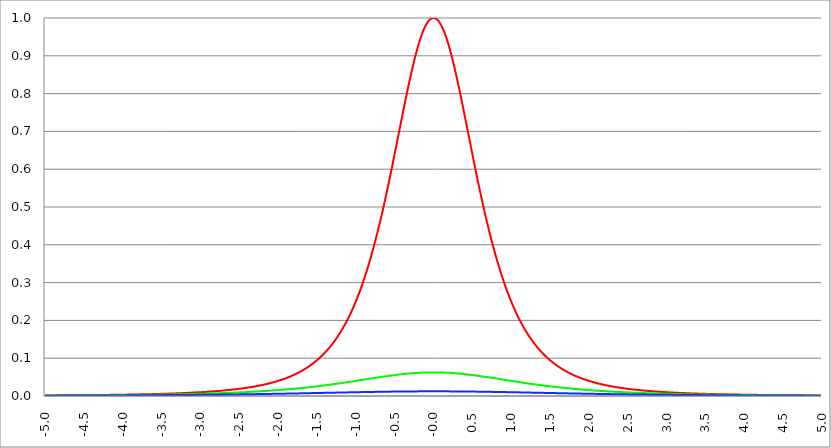
| Category | Series 1 | Series 0 | Series 2 |
|---|---|---|---|
| -5.0 | 0.001 | 0.001 | 0.001 |
| -4.995 | 0.001 | 0.001 | 0.001 |
| -4.99 | 0.001 | 0.001 | 0.001 |
| -4.985 | 0.001 | 0.001 | 0.001 |
| -4.98 | 0.002 | 0.001 | 0.001 |
| -4.975 | 0.002 | 0.001 | 0.001 |
| -4.97 | 0.002 | 0.001 | 0.001 |
| -4.965000000000001 | 0.002 | 0.001 | 0.001 |
| -4.960000000000001 | 0.002 | 0.001 | 0.001 |
| -4.955000000000001 | 0.002 | 0.001 | 0.001 |
| -4.950000000000001 | 0.002 | 0.001 | 0.001 |
| -4.945000000000001 | 0.002 | 0.001 | 0.001 |
| -4.940000000000001 | 0.002 | 0.001 | 0.001 |
| -4.935000000000001 | 0.002 | 0.001 | 0.001 |
| -4.930000000000001 | 0.002 | 0.001 | 0.001 |
| -4.925000000000002 | 0.002 | 0.001 | 0.001 |
| -4.920000000000002 | 0.002 | 0.001 | 0.001 |
| -4.915000000000002 | 0.002 | 0.001 | 0.001 |
| -4.910000000000002 | 0.002 | 0.001 | 0.001 |
| -4.905000000000002 | 0.002 | 0.001 | 0.001 |
| -4.900000000000002 | 0.002 | 0.001 | 0.001 |
| -4.895000000000002 | 0.002 | 0.001 | 0.001 |
| -4.890000000000002 | 0.002 | 0.001 | 0.001 |
| -4.885000000000002 | 0.002 | 0.001 | 0.001 |
| -4.880000000000002 | 0.002 | 0.001 | 0.001 |
| -4.875000000000003 | 0.002 | 0.001 | 0.001 |
| -4.870000000000003 | 0.002 | 0.001 | 0.001 |
| -4.865000000000003 | 0.002 | 0.001 | 0.001 |
| -4.860000000000003 | 0.002 | 0.001 | 0.001 |
| -4.855000000000003 | 0.002 | 0.001 | 0.001 |
| -4.850000000000003 | 0.002 | 0.001 | 0.001 |
| -4.845000000000003 | 0.002 | 0.001 | 0.001 |
| -4.840000000000003 | 0.002 | 0.001 | 0.001 |
| -4.835000000000003 | 0.002 | 0.001 | 0.001 |
| -4.830000000000004 | 0.002 | 0.001 | 0.001 |
| -4.825000000000004 | 0.002 | 0.001 | 0.001 |
| -4.820000000000004 | 0.002 | 0.001 | 0.001 |
| -4.815000000000004 | 0.002 | 0.001 | 0.001 |
| -4.810000000000004 | 0.002 | 0.001 | 0.001 |
| -4.805000000000004 | 0.002 | 0.001 | 0.001 |
| -4.800000000000004 | 0.002 | 0.001 | 0.001 |
| -4.795000000000004 | 0.002 | 0.001 | 0.001 |
| -4.790000000000004 | 0.002 | 0.001 | 0.001 |
| -4.785000000000004 | 0.002 | 0.001 | 0.001 |
| -4.780000000000004 | 0.002 | 0.001 | 0.001 |
| -4.775000000000004 | 0.002 | 0.001 | 0.001 |
| -4.770000000000004 | 0.002 | 0.001 | 0.001 |
| -4.765000000000005 | 0.002 | 0.001 | 0.001 |
| -4.760000000000005 | 0.002 | 0.001 | 0.001 |
| -4.755000000000005 | 0.002 | 0.001 | 0.001 |
| -4.750000000000005 | 0.002 | 0.001 | 0.001 |
| -4.745000000000005 | 0.002 | 0.001 | 0.001 |
| -4.740000000000005 | 0.002 | 0.001 | 0.001 |
| -4.735000000000005 | 0.002 | 0.001 | 0.001 |
| -4.730000000000005 | 0.002 | 0.001 | 0.001 |
| -4.725000000000006 | 0.002 | 0.001 | 0.001 |
| -4.720000000000006 | 0.002 | 0.001 | 0.001 |
| -4.715000000000006 | 0.002 | 0.001 | 0.001 |
| -4.710000000000006 | 0.002 | 0.001 | 0.001 |
| -4.705000000000006 | 0.002 | 0.001 | 0.001 |
| -4.700000000000006 | 0.002 | 0.001 | 0.001 |
| -4.695000000000006 | 0.002 | 0.001 | 0.001 |
| -4.690000000000006 | 0.002 | 0.001 | 0.001 |
| -4.685000000000007 | 0.002 | 0.001 | 0.001 |
| -4.680000000000007 | 0.002 | 0.001 | 0.001 |
| -4.675000000000007 | 0.002 | 0.001 | 0.001 |
| -4.670000000000007 | 0.002 | 0.002 | 0.001 |
| -4.665000000000007 | 0.002 | 0.002 | 0.001 |
| -4.660000000000007 | 0.002 | 0.002 | 0.001 |
| -4.655000000000007 | 0.002 | 0.002 | 0.001 |
| -4.650000000000007 | 0.002 | 0.002 | 0.001 |
| -4.645000000000007 | 0.002 | 0.002 | 0.001 |
| -4.640000000000008 | 0.002 | 0.002 | 0.001 |
| -4.635000000000008 | 0.002 | 0.002 | 0.001 |
| -4.630000000000008 | 0.002 | 0.002 | 0.001 |
| -4.625000000000008 | 0.002 | 0.002 | 0.001 |
| -4.620000000000008 | 0.002 | 0.002 | 0.001 |
| -4.615000000000008 | 0.002 | 0.002 | 0.001 |
| -4.610000000000008 | 0.002 | 0.002 | 0.001 |
| -4.605000000000008 | 0.002 | 0.002 | 0.001 |
| -4.600000000000008 | 0.002 | 0.002 | 0.001 |
| -4.595000000000009 | 0.002 | 0.002 | 0.001 |
| -4.590000000000009 | 0.002 | 0.002 | 0.001 |
| -4.585000000000009 | 0.002 | 0.002 | 0.001 |
| -4.580000000000009 | 0.002 | 0.002 | 0.001 |
| -4.57500000000001 | 0.002 | 0.002 | 0.001 |
| -4.57000000000001 | 0.002 | 0.002 | 0.001 |
| -4.565000000000009 | 0.002 | 0.002 | 0.001 |
| -4.560000000000009 | 0.002 | 0.002 | 0.001 |
| -4.555000000000009 | 0.002 | 0.002 | 0.001 |
| -4.55000000000001 | 0.002 | 0.002 | 0.001 |
| -4.54500000000001 | 0.002 | 0.002 | 0.001 |
| -4.54000000000001 | 0.002 | 0.002 | 0.001 |
| -4.53500000000001 | 0.002 | 0.002 | 0.001 |
| -4.53000000000001 | 0.002 | 0.002 | 0.001 |
| -4.52500000000001 | 0.002 | 0.002 | 0.001 |
| -4.52000000000001 | 0.002 | 0.002 | 0.001 |
| -4.51500000000001 | 0.002 | 0.002 | 0.001 |
| -4.51000000000001 | 0.002 | 0.002 | 0.001 |
| -4.505000000000011 | 0.002 | 0.002 | 0.001 |
| -4.500000000000011 | 0.002 | 0.002 | 0.001 |
| -4.495000000000011 | 0.002 | 0.002 | 0.001 |
| -4.490000000000011 | 0.002 | 0.002 | 0.001 |
| -4.485000000000011 | 0.002 | 0.002 | 0.001 |
| -4.480000000000011 | 0.002 | 0.002 | 0.001 |
| -4.475000000000011 | 0.002 | 0.002 | 0.001 |
| -4.470000000000011 | 0.002 | 0.002 | 0.001 |
| -4.465000000000011 | 0.002 | 0.002 | 0.001 |
| -4.460000000000011 | 0.002 | 0.002 | 0.001 |
| -4.455000000000012 | 0.002 | 0.002 | 0.001 |
| -4.450000000000012 | 0.002 | 0.002 | 0.001 |
| -4.445000000000012 | 0.002 | 0.002 | 0.001 |
| -4.440000000000012 | 0.002 | 0.002 | 0.001 |
| -4.435000000000012 | 0.002 | 0.002 | 0.001 |
| -4.430000000000012 | 0.002 | 0.002 | 0.001 |
| -4.425000000000012 | 0.002 | 0.002 | 0.001 |
| -4.420000000000012 | 0.002 | 0.002 | 0.001 |
| -4.415000000000012 | 0.002 | 0.002 | 0.001 |
| -4.410000000000013 | 0.002 | 0.002 | 0.001 |
| -4.405000000000013 | 0.002 | 0.002 | 0.001 |
| -4.400000000000013 | 0.002 | 0.002 | 0.001 |
| -4.395000000000013 | 0.002 | 0.002 | 0.001 |
| -4.390000000000013 | 0.002 | 0.002 | 0.001 |
| -4.385000000000013 | 0.002 | 0.002 | 0.001 |
| -4.380000000000013 | 0.002 | 0.002 | 0.001 |
| -4.375000000000013 | 0.002 | 0.002 | 0.001 |
| -4.370000000000013 | 0.002 | 0.002 | 0.001 |
| -4.365000000000013 | 0.002 | 0.002 | 0.001 |
| -4.360000000000014 | 0.002 | 0.002 | 0.001 |
| -4.355000000000014 | 0.003 | 0.002 | 0.001 |
| -4.350000000000014 | 0.003 | 0.002 | 0.001 |
| -4.345000000000014 | 0.003 | 0.002 | 0.001 |
| -4.340000000000014 | 0.003 | 0.002 | 0.001 |
| -4.335000000000014 | 0.003 | 0.002 | 0.001 |
| -4.330000000000014 | 0.003 | 0.002 | 0.001 |
| -4.325000000000014 | 0.003 | 0.002 | 0.001 |
| -4.320000000000014 | 0.003 | 0.002 | 0.001 |
| -4.315000000000015 | 0.003 | 0.002 | 0.001 |
| -4.310000000000015 | 0.003 | 0.002 | 0.001 |
| -4.305000000000015 | 0.003 | 0.002 | 0.001 |
| -4.300000000000015 | 0.003 | 0.002 | 0.001 |
| -4.295000000000015 | 0.003 | 0.002 | 0.001 |
| -4.290000000000015 | 0.003 | 0.002 | 0.001 |
| -4.285000000000015 | 0.003 | 0.002 | 0.001 |
| -4.280000000000015 | 0.003 | 0.002 | 0.001 |
| -4.275000000000015 | 0.003 | 0.002 | 0.001 |
| -4.270000000000015 | 0.003 | 0.002 | 0.001 |
| -4.265000000000016 | 0.003 | 0.002 | 0.001 |
| -4.260000000000016 | 0.003 | 0.002 | 0.001 |
| -4.255000000000016 | 0.003 | 0.002 | 0.001 |
| -4.250000000000016 | 0.003 | 0.002 | 0.001 |
| -4.245000000000016 | 0.003 | 0.002 | 0.001 |
| -4.240000000000016 | 0.003 | 0.002 | 0.001 |
| -4.235000000000016 | 0.003 | 0.002 | 0.001 |
| -4.230000000000016 | 0.003 | 0.002 | 0.001 |
| -4.225000000000017 | 0.003 | 0.002 | 0.001 |
| -4.220000000000017 | 0.003 | 0.002 | 0.001 |
| -4.215000000000017 | 0.003 | 0.002 | 0.001 |
| -4.210000000000017 | 0.003 | 0.002 | 0.001 |
| -4.205000000000017 | 0.003 | 0.002 | 0.001 |
| -4.200000000000017 | 0.003 | 0.002 | 0.001 |
| -4.195000000000017 | 0.003 | 0.002 | 0.001 |
| -4.190000000000017 | 0.003 | 0.002 | 0.001 |
| -4.185000000000017 | 0.003 | 0.002 | 0.001 |
| -4.180000000000017 | 0.003 | 0.002 | 0.001 |
| -4.175000000000018 | 0.003 | 0.002 | 0.001 |
| -4.170000000000018 | 0.003 | 0.002 | 0.001 |
| -4.165000000000018 | 0.003 | 0.002 | 0.001 |
| -4.160000000000018 | 0.003 | 0.002 | 0.001 |
| -4.155000000000018 | 0.003 | 0.002 | 0.001 |
| -4.150000000000018 | 0.003 | 0.002 | 0.001 |
| -4.145000000000018 | 0.003 | 0.002 | 0.001 |
| -4.140000000000018 | 0.003 | 0.002 | 0.001 |
| -4.135000000000018 | 0.003 | 0.002 | 0.001 |
| -4.130000000000019 | 0.003 | 0.002 | 0.001 |
| -4.125000000000019 | 0.003 | 0.002 | 0.001 |
| -4.120000000000019 | 0.003 | 0.002 | 0.001 |
| -4.115000000000019 | 0.003 | 0.002 | 0.001 |
| -4.110000000000019 | 0.003 | 0.002 | 0.001 |
| -4.105000000000019 | 0.003 | 0.002 | 0.001 |
| -4.100000000000019 | 0.003 | 0.002 | 0.002 |
| -4.095000000000019 | 0.003 | 0.002 | 0.002 |
| -4.090000000000019 | 0.003 | 0.002 | 0.002 |
| -4.085000000000019 | 0.003 | 0.002 | 0.002 |
| -4.08000000000002 | 0.003 | 0.002 | 0.002 |
| -4.07500000000002 | 0.003 | 0.002 | 0.002 |
| -4.07000000000002 | 0.003 | 0.002 | 0.002 |
| -4.06500000000002 | 0.003 | 0.002 | 0.002 |
| -4.06000000000002 | 0.003 | 0.002 | 0.002 |
| -4.05500000000002 | 0.003 | 0.002 | 0.002 |
| -4.05000000000002 | 0.003 | 0.002 | 0.002 |
| -4.04500000000002 | 0.003 | 0.002 | 0.002 |
| -4.04000000000002 | 0.003 | 0.002 | 0.002 |
| -4.03500000000002 | 0.003 | 0.002 | 0.002 |
| -4.03000000000002 | 0.003 | 0.002 | 0.002 |
| -4.025000000000021 | 0.003 | 0.002 | 0.002 |
| -4.020000000000021 | 0.003 | 0.002 | 0.002 |
| -4.015000000000021 | 0.003 | 0.002 | 0.002 |
| -4.010000000000021 | 0.003 | 0.002 | 0.002 |
| -4.005000000000021 | 0.003 | 0.002 | 0.002 |
| -4.000000000000021 | 0.003 | 0.002 | 0.002 |
| -3.995000000000021 | 0.003 | 0.003 | 0.002 |
| -3.990000000000021 | 0.003 | 0.003 | 0.002 |
| -3.985000000000022 | 0.004 | 0.003 | 0.002 |
| -3.980000000000022 | 0.004 | 0.003 | 0.002 |
| -3.975000000000022 | 0.004 | 0.003 | 0.002 |
| -3.970000000000022 | 0.004 | 0.003 | 0.002 |
| -3.965000000000022 | 0.004 | 0.003 | 0.002 |
| -3.960000000000022 | 0.004 | 0.003 | 0.002 |
| -3.955000000000022 | 0.004 | 0.003 | 0.002 |
| -3.950000000000022 | 0.004 | 0.003 | 0.002 |
| -3.945000000000022 | 0.004 | 0.003 | 0.002 |
| -3.940000000000023 | 0.004 | 0.003 | 0.002 |
| -3.935000000000023 | 0.004 | 0.003 | 0.002 |
| -3.930000000000023 | 0.004 | 0.003 | 0.002 |
| -3.925000000000023 | 0.004 | 0.003 | 0.002 |
| -3.920000000000023 | 0.004 | 0.003 | 0.002 |
| -3.915000000000023 | 0.004 | 0.003 | 0.002 |
| -3.910000000000023 | 0.004 | 0.003 | 0.002 |
| -3.905000000000023 | 0.004 | 0.003 | 0.002 |
| -3.900000000000023 | 0.004 | 0.003 | 0.002 |
| -3.895000000000023 | 0.004 | 0.003 | 0.002 |
| -3.890000000000024 | 0.004 | 0.003 | 0.002 |
| -3.885000000000024 | 0.004 | 0.003 | 0.002 |
| -3.880000000000024 | 0.004 | 0.003 | 0.002 |
| -3.875000000000024 | 0.004 | 0.003 | 0.002 |
| -3.870000000000024 | 0.004 | 0.003 | 0.002 |
| -3.865000000000024 | 0.004 | 0.003 | 0.002 |
| -3.860000000000024 | 0.004 | 0.003 | 0.002 |
| -3.855000000000024 | 0.004 | 0.003 | 0.002 |
| -3.850000000000024 | 0.004 | 0.003 | 0.002 |
| -3.845000000000025 | 0.004 | 0.003 | 0.002 |
| -3.840000000000025 | 0.004 | 0.003 | 0.002 |
| -3.835000000000025 | 0.004 | 0.003 | 0.002 |
| -3.830000000000025 | 0.004 | 0.003 | 0.002 |
| -3.825000000000025 | 0.004 | 0.003 | 0.002 |
| -3.820000000000025 | 0.004 | 0.003 | 0.002 |
| -3.815000000000025 | 0.004 | 0.003 | 0.002 |
| -3.810000000000025 | 0.004 | 0.003 | 0.002 |
| -3.805000000000025 | 0.004 | 0.003 | 0.002 |
| -3.800000000000026 | 0.004 | 0.003 | 0.002 |
| -3.795000000000026 | 0.004 | 0.003 | 0.002 |
| -3.790000000000026 | 0.004 | 0.003 | 0.002 |
| -3.785000000000026 | 0.004 | 0.003 | 0.002 |
| -3.780000000000026 | 0.004 | 0.003 | 0.002 |
| -3.775000000000026 | 0.004 | 0.003 | 0.002 |
| -3.770000000000026 | 0.004 | 0.003 | 0.002 |
| -3.765000000000026 | 0.004 | 0.003 | 0.002 |
| -3.760000000000026 | 0.004 | 0.003 | 0.002 |
| -3.755000000000026 | 0.004 | 0.003 | 0.002 |
| -3.750000000000027 | 0.004 | 0.003 | 0.002 |
| -3.745000000000027 | 0.004 | 0.003 | 0.002 |
| -3.740000000000027 | 0.004 | 0.003 | 0.002 |
| -3.735000000000027 | 0.004 | 0.003 | 0.002 |
| -3.730000000000027 | 0.004 | 0.003 | 0.002 |
| -3.725000000000027 | 0.005 | 0.003 | 0.002 |
| -3.720000000000027 | 0.005 | 0.003 | 0.002 |
| -3.715000000000027 | 0.005 | 0.003 | 0.002 |
| -3.710000000000027 | 0.005 | 0.003 | 0.002 |
| -3.705000000000028 | 0.005 | 0.003 | 0.002 |
| -3.700000000000028 | 0.005 | 0.003 | 0.002 |
| -3.695000000000028 | 0.005 | 0.003 | 0.002 |
| -3.690000000000028 | 0.005 | 0.003 | 0.002 |
| -3.685000000000028 | 0.005 | 0.003 | 0.002 |
| -3.680000000000028 | 0.005 | 0.003 | 0.002 |
| -3.675000000000028 | 0.005 | 0.003 | 0.002 |
| -3.670000000000028 | 0.005 | 0.003 | 0.002 |
| -3.665000000000028 | 0.005 | 0.003 | 0.002 |
| -3.660000000000028 | 0.005 | 0.003 | 0.002 |
| -3.655000000000029 | 0.005 | 0.003 | 0.002 |
| -3.650000000000029 | 0.005 | 0.003 | 0.002 |
| -3.645000000000029 | 0.005 | 0.003 | 0.002 |
| -3.640000000000029 | 0.005 | 0.003 | 0.002 |
| -3.635000000000029 | 0.005 | 0.003 | 0.002 |
| -3.630000000000029 | 0.005 | 0.003 | 0.002 |
| -3.625000000000029 | 0.005 | 0.003 | 0.002 |
| -3.620000000000029 | 0.005 | 0.003 | 0.002 |
| -3.615000000000029 | 0.005 | 0.003 | 0.002 |
| -3.61000000000003 | 0.005 | 0.003 | 0.002 |
| -3.60500000000003 | 0.005 | 0.003 | 0.002 |
| -3.60000000000003 | 0.005 | 0.003 | 0.002 |
| -3.59500000000003 | 0.005 | 0.003 | 0.002 |
| -3.59000000000003 | 0.005 | 0.004 | 0.002 |
| -3.58500000000003 | 0.005 | 0.004 | 0.002 |
| -3.58000000000003 | 0.005 | 0.004 | 0.002 |
| -3.57500000000003 | 0.005 | 0.004 | 0.002 |
| -3.57000000000003 | 0.005 | 0.004 | 0.002 |
| -3.565000000000031 | 0.005 | 0.004 | 0.002 |
| -3.560000000000031 | 0.005 | 0.004 | 0.002 |
| -3.555000000000031 | 0.005 | 0.004 | 0.002 |
| -3.550000000000031 | 0.005 | 0.004 | 0.002 |
| -3.545000000000031 | 0.005 | 0.004 | 0.002 |
| -3.540000000000031 | 0.005 | 0.004 | 0.002 |
| -3.535000000000031 | 0.005 | 0.004 | 0.002 |
| -3.530000000000031 | 0.006 | 0.004 | 0.002 |
| -3.525000000000031 | 0.006 | 0.004 | 0.002 |
| -3.520000000000032 | 0.006 | 0.004 | 0.002 |
| -3.515000000000032 | 0.006 | 0.004 | 0.002 |
| -3.510000000000032 | 0.006 | 0.004 | 0.002 |
| -3.505000000000032 | 0.006 | 0.004 | 0.002 |
| -3.500000000000032 | 0.006 | 0.004 | 0.002 |
| -3.495000000000032 | 0.006 | 0.004 | 0.002 |
| -3.490000000000032 | 0.006 | 0.004 | 0.002 |
| -3.485000000000032 | 0.006 | 0.004 | 0.002 |
| -3.480000000000032 | 0.006 | 0.004 | 0.002 |
| -3.475000000000032 | 0.006 | 0.004 | 0.002 |
| -3.470000000000033 | 0.006 | 0.004 | 0.002 |
| -3.465000000000033 | 0.006 | 0.004 | 0.002 |
| -3.460000000000033 | 0.006 | 0.004 | 0.002 |
| -3.455000000000033 | 0.006 | 0.004 | 0.002 |
| -3.450000000000033 | 0.006 | 0.004 | 0.002 |
| -3.445000000000033 | 0.006 | 0.004 | 0.002 |
| -3.440000000000033 | 0.006 | 0.004 | 0.002 |
| -3.435000000000033 | 0.006 | 0.004 | 0.002 |
| -3.430000000000033 | 0.006 | 0.004 | 0.002 |
| -3.425000000000034 | 0.006 | 0.004 | 0.002 |
| -3.420000000000034 | 0.006 | 0.004 | 0.002 |
| -3.415000000000034 | 0.006 | 0.004 | 0.002 |
| -3.410000000000034 | 0.006 | 0.004 | 0.002 |
| -3.405000000000034 | 0.006 | 0.004 | 0.002 |
| -3.400000000000034 | 0.006 | 0.004 | 0.002 |
| -3.395000000000034 | 0.006 | 0.004 | 0.002 |
| -3.390000000000034 | 0.006 | 0.004 | 0.002 |
| -3.385000000000034 | 0.006 | 0.004 | 0.002 |
| -3.380000000000034 | 0.006 | 0.004 | 0.002 |
| -3.375000000000035 | 0.007 | 0.004 | 0.002 |
| -3.370000000000035 | 0.007 | 0.004 | 0.002 |
| -3.365000000000035 | 0.007 | 0.004 | 0.002 |
| -3.360000000000035 | 0.007 | 0.004 | 0.002 |
| -3.355000000000035 | 0.007 | 0.004 | 0.002 |
| -3.350000000000035 | 0.007 | 0.004 | 0.002 |
| -3.345000000000035 | 0.007 | 0.004 | 0.002 |
| -3.340000000000035 | 0.007 | 0.004 | 0.002 |
| -3.335000000000035 | 0.007 | 0.004 | 0.002 |
| -3.330000000000036 | 0.007 | 0.004 | 0.002 |
| -3.325000000000036 | 0.007 | 0.004 | 0.002 |
| -3.320000000000036 | 0.007 | 0.004 | 0.002 |
| -3.315000000000036 | 0.007 | 0.004 | 0.003 |
| -3.310000000000036 | 0.007 | 0.004 | 0.003 |
| -3.305000000000036 | 0.007 | 0.004 | 0.003 |
| -3.300000000000036 | 0.007 | 0.005 | 0.003 |
| -3.295000000000036 | 0.007 | 0.005 | 0.003 |
| -3.290000000000036 | 0.007 | 0.005 | 0.003 |
| -3.285000000000036 | 0.007 | 0.005 | 0.003 |
| -3.280000000000036 | 0.007 | 0.005 | 0.003 |
| -3.275000000000037 | 0.007 | 0.005 | 0.003 |
| -3.270000000000037 | 0.007 | 0.005 | 0.003 |
| -3.265000000000037 | 0.007 | 0.005 | 0.003 |
| -3.260000000000037 | 0.007 | 0.005 | 0.003 |
| -3.255000000000037 | 0.007 | 0.005 | 0.003 |
| -3.250000000000037 | 0.007 | 0.005 | 0.003 |
| -3.245000000000037 | 0.008 | 0.005 | 0.003 |
| -3.240000000000037 | 0.008 | 0.005 | 0.003 |
| -3.235000000000038 | 0.008 | 0.005 | 0.003 |
| -3.230000000000038 | 0.008 | 0.005 | 0.003 |
| -3.225000000000038 | 0.008 | 0.005 | 0.003 |
| -3.220000000000038 | 0.008 | 0.005 | 0.003 |
| -3.215000000000038 | 0.008 | 0.005 | 0.003 |
| -3.210000000000038 | 0.008 | 0.005 | 0.003 |
| -3.205000000000038 | 0.008 | 0.005 | 0.003 |
| -3.200000000000038 | 0.008 | 0.005 | 0.003 |
| -3.195000000000038 | 0.008 | 0.005 | 0.003 |
| -3.190000000000039 | 0.008 | 0.005 | 0.003 |
| -3.185000000000039 | 0.008 | 0.005 | 0.003 |
| -3.180000000000039 | 0.008 | 0.005 | 0.003 |
| -3.175000000000039 | 0.008 | 0.005 | 0.003 |
| -3.170000000000039 | 0.008 | 0.005 | 0.003 |
| -3.16500000000004 | 0.008 | 0.005 | 0.003 |
| -3.16000000000004 | 0.008 | 0.005 | 0.003 |
| -3.155000000000039 | 0.008 | 0.005 | 0.003 |
| -3.150000000000039 | 0.008 | 0.005 | 0.003 |
| -3.14500000000004 | 0.008 | 0.005 | 0.003 |
| -3.14000000000004 | 0.008 | 0.005 | 0.003 |
| -3.13500000000004 | 0.009 | 0.005 | 0.003 |
| -3.13000000000004 | 0.009 | 0.005 | 0.003 |
| -3.12500000000004 | 0.009 | 0.005 | 0.003 |
| -3.12000000000004 | 0.009 | 0.005 | 0.003 |
| -3.11500000000004 | 0.009 | 0.005 | 0.003 |
| -3.11000000000004 | 0.009 | 0.005 | 0.003 |
| -3.10500000000004 | 0.009 | 0.005 | 0.003 |
| -3.10000000000004 | 0.009 | 0.005 | 0.003 |
| -3.095000000000041 | 0.009 | 0.005 | 0.003 |
| -3.090000000000041 | 0.009 | 0.005 | 0.003 |
| -3.085000000000041 | 0.009 | 0.005 | 0.003 |
| -3.080000000000041 | 0.009 | 0.005 | 0.003 |
| -3.075000000000041 | 0.009 | 0.006 | 0.003 |
| -3.070000000000041 | 0.009 | 0.006 | 0.003 |
| -3.065000000000041 | 0.009 | 0.006 | 0.003 |
| -3.060000000000041 | 0.009 | 0.006 | 0.003 |
| -3.055000000000041 | 0.009 | 0.006 | 0.003 |
| -3.050000000000042 | 0.009 | 0.006 | 0.003 |
| -3.045000000000042 | 0.009 | 0.006 | 0.003 |
| -3.040000000000042 | 0.01 | 0.006 | 0.003 |
| -3.035000000000042 | 0.01 | 0.006 | 0.003 |
| -3.030000000000042 | 0.01 | 0.006 | 0.003 |
| -3.025000000000042 | 0.01 | 0.006 | 0.003 |
| -3.020000000000042 | 0.01 | 0.006 | 0.003 |
| -3.015000000000042 | 0.01 | 0.006 | 0.003 |
| -3.010000000000042 | 0.01 | 0.006 | 0.003 |
| -3.005000000000043 | 0.01 | 0.006 | 0.003 |
| -3.000000000000043 | 0.01 | 0.006 | 0.003 |
| -2.995000000000043 | 0.01 | 0.006 | 0.003 |
| -2.990000000000043 | 0.01 | 0.006 | 0.003 |
| -2.985000000000043 | 0.01 | 0.006 | 0.003 |
| -2.980000000000043 | 0.01 | 0.006 | 0.003 |
| -2.975000000000043 | 0.01 | 0.006 | 0.003 |
| -2.970000000000043 | 0.01 | 0.006 | 0.003 |
| -2.965000000000043 | 0.01 | 0.006 | 0.003 |
| -2.960000000000043 | 0.01 | 0.006 | 0.003 |
| -2.955000000000044 | 0.011 | 0.006 | 0.003 |
| -2.950000000000044 | 0.011 | 0.006 | 0.003 |
| -2.945000000000044 | 0.011 | 0.006 | 0.003 |
| -2.940000000000044 | 0.011 | 0.006 | 0.003 |
| -2.935000000000044 | 0.011 | 0.006 | 0.003 |
| -2.930000000000044 | 0.011 | 0.006 | 0.003 |
| -2.925000000000044 | 0.011 | 0.006 | 0.003 |
| -2.920000000000044 | 0.011 | 0.006 | 0.003 |
| -2.915000000000044 | 0.011 | 0.006 | 0.003 |
| -2.910000000000045 | 0.011 | 0.006 | 0.003 |
| -2.905000000000045 | 0.011 | 0.006 | 0.003 |
| -2.900000000000045 | 0.011 | 0.006 | 0.003 |
| -2.895000000000045 | 0.011 | 0.007 | 0.003 |
| -2.890000000000045 | 0.011 | 0.007 | 0.003 |
| -2.885000000000045 | 0.012 | 0.007 | 0.003 |
| -2.880000000000045 | 0.012 | 0.007 | 0.003 |
| -2.875000000000045 | 0.012 | 0.007 | 0.003 |
| -2.870000000000045 | 0.012 | 0.007 | 0.003 |
| -2.865000000000045 | 0.012 | 0.007 | 0.003 |
| -2.860000000000046 | 0.012 | 0.007 | 0.003 |
| -2.855000000000046 | 0.012 | 0.007 | 0.003 |
| -2.850000000000046 | 0.012 | 0.007 | 0.003 |
| -2.845000000000046 | 0.012 | 0.007 | 0.003 |
| -2.840000000000046 | 0.012 | 0.007 | 0.003 |
| -2.835000000000046 | 0.012 | 0.007 | 0.003 |
| -2.830000000000046 | 0.012 | 0.007 | 0.003 |
| -2.825000000000046 | 0.012 | 0.007 | 0.003 |
| -2.820000000000046 | 0.012 | 0.007 | 0.003 |
| -2.815000000000047 | 0.013 | 0.007 | 0.003 |
| -2.810000000000047 | 0.013 | 0.007 | 0.004 |
| -2.805000000000047 | 0.013 | 0.007 | 0.004 |
| -2.800000000000047 | 0.013 | 0.007 | 0.004 |
| -2.795000000000047 | 0.013 | 0.007 | 0.004 |
| -2.790000000000047 | 0.013 | 0.007 | 0.004 |
| -2.785000000000047 | 0.013 | 0.007 | 0.004 |
| -2.780000000000047 | 0.013 | 0.007 | 0.004 |
| -2.775000000000047 | 0.013 | 0.007 | 0.004 |
| -2.770000000000047 | 0.013 | 0.007 | 0.004 |
| -2.765000000000048 | 0.013 | 0.007 | 0.004 |
| -2.760000000000048 | 0.013 | 0.007 | 0.004 |
| -2.755000000000048 | 0.014 | 0.007 | 0.004 |
| -2.750000000000048 | 0.014 | 0.007 | 0.004 |
| -2.745000000000048 | 0.014 | 0.008 | 0.004 |
| -2.740000000000048 | 0.014 | 0.008 | 0.004 |
| -2.735000000000048 | 0.014 | 0.008 | 0.004 |
| -2.730000000000048 | 0.014 | 0.008 | 0.004 |
| -2.725000000000048 | 0.014 | 0.008 | 0.004 |
| -2.720000000000049 | 0.014 | 0.008 | 0.004 |
| -2.715000000000049 | 0.014 | 0.008 | 0.004 |
| -2.710000000000049 | 0.014 | 0.008 | 0.004 |
| -2.705000000000049 | 0.014 | 0.008 | 0.004 |
| -2.700000000000049 | 0.015 | 0.008 | 0.004 |
| -2.695000000000049 | 0.015 | 0.008 | 0.004 |
| -2.690000000000049 | 0.015 | 0.008 | 0.004 |
| -2.685000000000049 | 0.015 | 0.008 | 0.004 |
| -2.680000000000049 | 0.015 | 0.008 | 0.004 |
| -2.675000000000049 | 0.015 | 0.008 | 0.004 |
| -2.67000000000005 | 0.015 | 0.008 | 0.004 |
| -2.66500000000005 | 0.015 | 0.008 | 0.004 |
| -2.66000000000005 | 0.015 | 0.008 | 0.004 |
| -2.65500000000005 | 0.015 | 0.008 | 0.004 |
| -2.65000000000005 | 0.016 | 0.008 | 0.004 |
| -2.64500000000005 | 0.016 | 0.008 | 0.004 |
| -2.64000000000005 | 0.016 | 0.008 | 0.004 |
| -2.63500000000005 | 0.016 | 0.008 | 0.004 |
| -2.63000000000005 | 0.016 | 0.008 | 0.004 |
| -2.625000000000051 | 0.016 | 0.008 | 0.004 |
| -2.620000000000051 | 0.016 | 0.008 | 0.004 |
| -2.615000000000051 | 0.016 | 0.009 | 0.004 |
| -2.610000000000051 | 0.016 | 0.009 | 0.004 |
| -2.605000000000051 | 0.016 | 0.009 | 0.004 |
| -2.600000000000051 | 0.017 | 0.009 | 0.004 |
| -2.595000000000051 | 0.017 | 0.009 | 0.004 |
| -2.590000000000051 | 0.017 | 0.009 | 0.004 |
| -2.585000000000051 | 0.017 | 0.009 | 0.004 |
| -2.580000000000052 | 0.017 | 0.009 | 0.004 |
| -2.575000000000052 | 0.017 | 0.009 | 0.004 |
| -2.570000000000052 | 0.017 | 0.009 | 0.004 |
| -2.565000000000052 | 0.017 | 0.009 | 0.004 |
| -2.560000000000052 | 0.018 | 0.009 | 0.004 |
| -2.555000000000052 | 0.018 | 0.009 | 0.004 |
| -2.550000000000052 | 0.018 | 0.009 | 0.004 |
| -2.545000000000052 | 0.018 | 0.009 | 0.004 |
| -2.540000000000052 | 0.018 | 0.009 | 0.004 |
| -2.535000000000053 | 0.018 | 0.009 | 0.004 |
| -2.530000000000053 | 0.018 | 0.009 | 0.004 |
| -2.525000000000053 | 0.018 | 0.009 | 0.004 |
| -2.520000000000053 | 0.019 | 0.009 | 0.004 |
| -2.515000000000053 | 0.019 | 0.009 | 0.004 |
| -2.510000000000053 | 0.019 | 0.009 | 0.004 |
| -2.505000000000053 | 0.019 | 0.009 | 0.004 |
| -2.500000000000053 | 0.019 | 0.01 | 0.004 |
| -2.495000000000053 | 0.019 | 0.01 | 0.004 |
| -2.490000000000053 | 0.019 | 0.01 | 0.004 |
| -2.485000000000054 | 0.019 | 0.01 | 0.004 |
| -2.480000000000054 | 0.02 | 0.01 | 0.004 |
| -2.475000000000054 | 0.02 | 0.01 | 0.004 |
| -2.470000000000054 | 0.02 | 0.01 | 0.004 |
| -2.465000000000054 | 0.02 | 0.01 | 0.004 |
| -2.460000000000054 | 0.02 | 0.01 | 0.004 |
| -2.455000000000054 | 0.02 | 0.01 | 0.004 |
| -2.450000000000054 | 0.02 | 0.01 | 0.004 |
| -2.445000000000054 | 0.021 | 0.01 | 0.004 |
| -2.440000000000055 | 0.021 | 0.01 | 0.004 |
| -2.435000000000055 | 0.021 | 0.01 | 0.004 |
| -2.430000000000055 | 0.021 | 0.01 | 0.005 |
| -2.425000000000055 | 0.021 | 0.01 | 0.005 |
| -2.420000000000055 | 0.021 | 0.01 | 0.005 |
| -2.415000000000055 | 0.021 | 0.01 | 0.005 |
| -2.410000000000055 | 0.022 | 0.01 | 0.005 |
| -2.405000000000055 | 0.022 | 0.01 | 0.005 |
| -2.400000000000055 | 0.022 | 0.01 | 0.005 |
| -2.395000000000055 | 0.022 | 0.011 | 0.005 |
| -2.390000000000056 | 0.022 | 0.011 | 0.005 |
| -2.385000000000056 | 0.022 | 0.011 | 0.005 |
| -2.380000000000056 | 0.023 | 0.011 | 0.005 |
| -2.375000000000056 | 0.023 | 0.011 | 0.005 |
| -2.370000000000056 | 0.023 | 0.011 | 0.005 |
| -2.365000000000056 | 0.023 | 0.011 | 0.005 |
| -2.360000000000056 | 0.023 | 0.011 | 0.005 |
| -2.355000000000056 | 0.023 | 0.011 | 0.005 |
| -2.350000000000056 | 0.024 | 0.011 | 0.005 |
| -2.345000000000057 | 0.024 | 0.011 | 0.005 |
| -2.340000000000057 | 0.024 | 0.011 | 0.005 |
| -2.335000000000057 | 0.024 | 0.011 | 0.005 |
| -2.330000000000057 | 0.024 | 0.011 | 0.005 |
| -2.325000000000057 | 0.024 | 0.011 | 0.005 |
| -2.320000000000057 | 0.025 | 0.011 | 0.005 |
| -2.315000000000057 | 0.025 | 0.011 | 0.005 |
| -2.310000000000057 | 0.025 | 0.011 | 0.005 |
| -2.305000000000057 | 0.025 | 0.012 | 0.005 |
| -2.300000000000058 | 0.025 | 0.012 | 0.005 |
| -2.295000000000058 | 0.025 | 0.012 | 0.005 |
| -2.290000000000058 | 0.026 | 0.012 | 0.005 |
| -2.285000000000058 | 0.026 | 0.012 | 0.005 |
| -2.280000000000058 | 0.026 | 0.012 | 0.005 |
| -2.275000000000058 | 0.026 | 0.012 | 0.005 |
| -2.270000000000058 | 0.026 | 0.012 | 0.005 |
| -2.265000000000058 | 0.027 | 0.012 | 0.005 |
| -2.260000000000058 | 0.027 | 0.012 | 0.005 |
| -2.255000000000058 | 0.027 | 0.012 | 0.005 |
| -2.250000000000059 | 0.027 | 0.012 | 0.005 |
| -2.245000000000059 | 0.027 | 0.012 | 0.005 |
| -2.240000000000059 | 0.028 | 0.012 | 0.005 |
| -2.235000000000059 | 0.028 | 0.012 | 0.005 |
| -2.23000000000006 | 0.028 | 0.012 | 0.005 |
| -2.22500000000006 | 0.028 | 0.012 | 0.005 |
| -2.22000000000006 | 0.028 | 0.013 | 0.005 |
| -2.215000000000059 | 0.029 | 0.013 | 0.005 |
| -2.210000000000059 | 0.029 | 0.013 | 0.005 |
| -2.20500000000006 | 0.029 | 0.013 | 0.005 |
| -2.20000000000006 | 0.029 | 0.013 | 0.005 |
| -2.19500000000006 | 0.03 | 0.013 | 0.005 |
| -2.19000000000006 | 0.03 | 0.013 | 0.005 |
| -2.18500000000006 | 0.03 | 0.013 | 0.005 |
| -2.18000000000006 | 0.03 | 0.013 | 0.005 |
| -2.17500000000006 | 0.03 | 0.013 | 0.005 |
| -2.17000000000006 | 0.031 | 0.013 | 0.005 |
| -2.16500000000006 | 0.031 | 0.013 | 0.005 |
| -2.160000000000061 | 0.031 | 0.013 | 0.005 |
| -2.155000000000061 | 0.031 | 0.013 | 0.005 |
| -2.150000000000061 | 0.032 | 0.013 | 0.005 |
| -2.145000000000061 | 0.032 | 0.014 | 0.005 |
| -2.140000000000061 | 0.032 | 0.014 | 0.005 |
| -2.135000000000061 | 0.032 | 0.014 | 0.005 |
| -2.130000000000061 | 0.033 | 0.014 | 0.005 |
| -2.125000000000061 | 0.033 | 0.014 | 0.005 |
| -2.120000000000061 | 0.033 | 0.014 | 0.005 |
| -2.115000000000061 | 0.033 | 0.014 | 0.006 |
| -2.110000000000062 | 0.034 | 0.014 | 0.006 |
| -2.105000000000062 | 0.034 | 0.014 | 0.006 |
| -2.100000000000062 | 0.034 | 0.014 | 0.006 |
| -2.095000000000062 | 0.034 | 0.014 | 0.006 |
| -2.090000000000062 | 0.035 | 0.014 | 0.006 |
| -2.085000000000062 | 0.035 | 0.014 | 0.006 |
| -2.080000000000062 | 0.035 | 0.014 | 0.006 |
| -2.075000000000062 | 0.036 | 0.014 | 0.006 |
| -2.070000000000062 | 0.036 | 0.015 | 0.006 |
| -2.065000000000063 | 0.036 | 0.015 | 0.006 |
| -2.060000000000063 | 0.036 | 0.015 | 0.006 |
| -2.055000000000063 | 0.037 | 0.015 | 0.006 |
| -2.050000000000063 | 0.037 | 0.015 | 0.006 |
| -2.045000000000063 | 0.037 | 0.015 | 0.006 |
| -2.040000000000063 | 0.038 | 0.015 | 0.006 |
| -2.035000000000063 | 0.038 | 0.015 | 0.006 |
| -2.030000000000063 | 0.038 | 0.015 | 0.006 |
| -2.025000000000063 | 0.038 | 0.015 | 0.006 |
| -2.020000000000064 | 0.039 | 0.015 | 0.006 |
| -2.015000000000064 | 0.039 | 0.015 | 0.006 |
| -2.010000000000064 | 0.039 | 0.015 | 0.006 |
| -2.005000000000064 | 0.04 | 0.016 | 0.006 |
| -2.000000000000064 | 0.04 | 0.016 | 0.006 |
| -1.995000000000064 | 0.04 | 0.016 | 0.006 |
| -1.990000000000064 | 0.041 | 0.016 | 0.006 |
| -1.985000000000064 | 0.041 | 0.016 | 0.006 |
| -1.980000000000064 | 0.041 | 0.016 | 0.006 |
| -1.975000000000064 | 0.042 | 0.016 | 0.006 |
| -1.970000000000065 | 0.042 | 0.016 | 0.006 |
| -1.965000000000065 | 0.042 | 0.016 | 0.006 |
| -1.960000000000065 | 0.043 | 0.016 | 0.006 |
| -1.955000000000065 | 0.043 | 0.016 | 0.006 |
| -1.950000000000065 | 0.043 | 0.016 | 0.006 |
| -1.945000000000065 | 0.044 | 0.017 | 0.006 |
| -1.940000000000065 | 0.044 | 0.017 | 0.006 |
| -1.935000000000065 | 0.044 | 0.017 | 0.006 |
| -1.930000000000065 | 0.045 | 0.017 | 0.006 |
| -1.925000000000066 | 0.045 | 0.017 | 0.006 |
| -1.920000000000066 | 0.046 | 0.017 | 0.006 |
| -1.915000000000066 | 0.046 | 0.017 | 0.006 |
| -1.910000000000066 | 0.046 | 0.017 | 0.006 |
| -1.905000000000066 | 0.047 | 0.017 | 0.006 |
| -1.900000000000066 | 0.047 | 0.017 | 0.006 |
| -1.895000000000066 | 0.047 | 0.017 | 0.006 |
| -1.890000000000066 | 0.048 | 0.017 | 0.006 |
| -1.885000000000066 | 0.048 | 0.018 | 0.006 |
| -1.880000000000066 | 0.049 | 0.018 | 0.006 |
| -1.875000000000067 | 0.049 | 0.018 | 0.006 |
| -1.870000000000067 | 0.049 | 0.018 | 0.006 |
| -1.865000000000067 | 0.05 | 0.018 | 0.006 |
| -1.860000000000067 | 0.05 | 0.018 | 0.006 |
| -1.855000000000067 | 0.051 | 0.018 | 0.006 |
| -1.850000000000067 | 0.051 | 0.018 | 0.006 |
| -1.845000000000067 | 0.052 | 0.018 | 0.006 |
| -1.840000000000067 | 0.052 | 0.018 | 0.007 |
| -1.835000000000067 | 0.052 | 0.018 | 0.007 |
| -1.830000000000068 | 0.053 | 0.019 | 0.007 |
| -1.825000000000068 | 0.053 | 0.019 | 0.007 |
| -1.820000000000068 | 0.054 | 0.019 | 0.007 |
| -1.815000000000068 | 0.054 | 0.019 | 0.007 |
| -1.810000000000068 | 0.055 | 0.019 | 0.007 |
| -1.805000000000068 | 0.055 | 0.019 | 0.007 |
| -1.800000000000068 | 0.056 | 0.019 | 0.007 |
| -1.795000000000068 | 0.056 | 0.019 | 0.007 |
| -1.790000000000068 | 0.057 | 0.019 | 0.007 |
| -1.785000000000068 | 0.057 | 0.019 | 0.007 |
| -1.780000000000069 | 0.058 | 0.019 | 0.007 |
| -1.775000000000069 | 0.058 | 0.02 | 0.007 |
| -1.770000000000069 | 0.059 | 0.02 | 0.007 |
| -1.765000000000069 | 0.059 | 0.02 | 0.007 |
| -1.760000000000069 | 0.06 | 0.02 | 0.007 |
| -1.75500000000007 | 0.06 | 0.02 | 0.007 |
| -1.75000000000007 | 0.061 | 0.02 | 0.007 |
| -1.745000000000069 | 0.061 | 0.02 | 0.007 |
| -1.740000000000069 | 0.062 | 0.02 | 0.007 |
| -1.73500000000007 | 0.062 | 0.02 | 0.007 |
| -1.73000000000007 | 0.063 | 0.02 | 0.007 |
| -1.72500000000007 | 0.063 | 0.021 | 0.007 |
| -1.72000000000007 | 0.064 | 0.021 | 0.007 |
| -1.71500000000007 | 0.064 | 0.021 | 0.007 |
| -1.71000000000007 | 0.065 | 0.021 | 0.007 |
| -1.70500000000007 | 0.066 | 0.021 | 0.007 |
| -1.70000000000007 | 0.066 | 0.021 | 0.007 |
| -1.69500000000007 | 0.067 | 0.021 | 0.007 |
| -1.69000000000007 | 0.067 | 0.021 | 0.007 |
| -1.685000000000071 | 0.068 | 0.021 | 0.007 |
| -1.680000000000071 | 0.068 | 0.021 | 0.007 |
| -1.675000000000071 | 0.069 | 0.022 | 0.007 |
| -1.670000000000071 | 0.07 | 0.022 | 0.007 |
| -1.665000000000071 | 0.07 | 0.022 | 0.007 |
| -1.660000000000071 | 0.071 | 0.022 | 0.007 |
| -1.655000000000071 | 0.072 | 0.022 | 0.007 |
| -1.650000000000071 | 0.072 | 0.022 | 0.007 |
| -1.645000000000071 | 0.073 | 0.022 | 0.007 |
| -1.640000000000072 | 0.073 | 0.022 | 0.007 |
| -1.635000000000072 | 0.074 | 0.022 | 0.007 |
| -1.630000000000072 | 0.075 | 0.023 | 0.007 |
| -1.625000000000072 | 0.075 | 0.023 | 0.007 |
| -1.620000000000072 | 0.076 | 0.023 | 0.007 |
| -1.615000000000072 | 0.077 | 0.023 | 0.007 |
| -1.610000000000072 | 0.078 | 0.023 | 0.007 |
| -1.605000000000072 | 0.078 | 0.023 | 0.007 |
| -1.600000000000072 | 0.079 | 0.023 | 0.007 |
| -1.595000000000073 | 0.08 | 0.023 | 0.008 |
| -1.590000000000073 | 0.08 | 0.023 | 0.008 |
| -1.585000000000073 | 0.081 | 0.024 | 0.008 |
| -1.580000000000073 | 0.082 | 0.024 | 0.008 |
| -1.575000000000073 | 0.083 | 0.024 | 0.008 |
| -1.570000000000073 | 0.083 | 0.024 | 0.008 |
| -1.565000000000073 | 0.084 | 0.024 | 0.008 |
| -1.560000000000073 | 0.085 | 0.024 | 0.008 |
| -1.555000000000073 | 0.086 | 0.024 | 0.008 |
| -1.550000000000074 | 0.086 | 0.024 | 0.008 |
| -1.545000000000074 | 0.087 | 0.025 | 0.008 |
| -1.540000000000074 | 0.088 | 0.025 | 0.008 |
| -1.535000000000074 | 0.089 | 0.025 | 0.008 |
| -1.530000000000074 | 0.09 | 0.025 | 0.008 |
| -1.525000000000074 | 0.09 | 0.025 | 0.008 |
| -1.520000000000074 | 0.091 | 0.025 | 0.008 |
| -1.515000000000074 | 0.092 | 0.025 | 0.008 |
| -1.510000000000074 | 0.093 | 0.025 | 0.008 |
| -1.505000000000074 | 0.094 | 0.025 | 0.008 |
| -1.500000000000075 | 0.095 | 0.026 | 0.008 |
| -1.495000000000075 | 0.096 | 0.026 | 0.008 |
| -1.490000000000075 | 0.096 | 0.026 | 0.008 |
| -1.485000000000075 | 0.097 | 0.026 | 0.008 |
| -1.480000000000075 | 0.098 | 0.026 | 0.008 |
| -1.475000000000075 | 0.099 | 0.026 | 0.008 |
| -1.470000000000075 | 0.1 | 0.026 | 0.008 |
| -1.465000000000075 | 0.101 | 0.026 | 0.008 |
| -1.460000000000075 | 0.102 | 0.027 | 0.008 |
| -1.455000000000076 | 0.103 | 0.027 | 0.008 |
| -1.450000000000076 | 0.104 | 0.027 | 0.008 |
| -1.445000000000076 | 0.105 | 0.027 | 0.008 |
| -1.440000000000076 | 0.106 | 0.027 | 0.008 |
| -1.435000000000076 | 0.107 | 0.027 | 0.008 |
| -1.430000000000076 | 0.108 | 0.027 | 0.008 |
| -1.425000000000076 | 0.109 | 0.027 | 0.008 |
| -1.420000000000076 | 0.11 | 0.028 | 0.008 |
| -1.415000000000076 | 0.111 | 0.028 | 0.008 |
| -1.410000000000077 | 0.112 | 0.028 | 0.008 |
| -1.405000000000077 | 0.113 | 0.028 | 0.008 |
| -1.400000000000077 | 0.114 | 0.028 | 0.008 |
| -1.395000000000077 | 0.115 | 0.028 | 0.008 |
| -1.390000000000077 | 0.116 | 0.028 | 0.008 |
| -1.385000000000077 | 0.117 | 0.029 | 0.008 |
| -1.380000000000077 | 0.119 | 0.029 | 0.008 |
| -1.375000000000077 | 0.12 | 0.029 | 0.008 |
| -1.370000000000077 | 0.121 | 0.029 | 0.008 |
| -1.365000000000077 | 0.122 | 0.029 | 0.008 |
| -1.360000000000078 | 0.123 | 0.029 | 0.008 |
| -1.355000000000078 | 0.124 | 0.029 | 0.009 |
| -1.350000000000078 | 0.126 | 0.029 | 0.009 |
| -1.345000000000078 | 0.127 | 0.03 | 0.009 |
| -1.340000000000078 | 0.128 | 0.03 | 0.009 |
| -1.335000000000078 | 0.129 | 0.03 | 0.009 |
| -1.330000000000078 | 0.13 | 0.03 | 0.009 |
| -1.325000000000078 | 0.132 | 0.03 | 0.009 |
| -1.320000000000078 | 0.133 | 0.03 | 0.009 |
| -1.315000000000079 | 0.134 | 0.03 | 0.009 |
| -1.310000000000079 | 0.136 | 0.031 | 0.009 |
| -1.305000000000079 | 0.137 | 0.031 | 0.009 |
| -1.300000000000079 | 0.138 | 0.031 | 0.009 |
| -1.295000000000079 | 0.14 | 0.031 | 0.009 |
| -1.29000000000008 | 0.141 | 0.031 | 0.009 |
| -1.285000000000079 | 0.142 | 0.031 | 0.009 |
| -1.280000000000079 | 0.144 | 0.031 | 0.009 |
| -1.275000000000079 | 0.145 | 0.032 | 0.009 |
| -1.270000000000079 | 0.146 | 0.032 | 0.009 |
| -1.26500000000008 | 0.148 | 0.032 | 0.009 |
| -1.26000000000008 | 0.149 | 0.032 | 0.009 |
| -1.25500000000008 | 0.151 | 0.032 | 0.009 |
| -1.25000000000008 | 0.152 | 0.032 | 0.009 |
| -1.24500000000008 | 0.154 | 0.032 | 0.009 |
| -1.24000000000008 | 0.155 | 0.033 | 0.009 |
| -1.23500000000008 | 0.157 | 0.033 | 0.009 |
| -1.23000000000008 | 0.158 | 0.033 | 0.009 |
| -1.22500000000008 | 0.16 | 0.033 | 0.009 |
| -1.220000000000081 | 0.161 | 0.033 | 0.009 |
| -1.215000000000081 | 0.163 | 0.033 | 0.009 |
| -1.210000000000081 | 0.165 | 0.033 | 0.009 |
| -1.205000000000081 | 0.166 | 0.034 | 0.009 |
| -1.200000000000081 | 0.168 | 0.034 | 0.009 |
| -1.195000000000081 | 0.17 | 0.034 | 0.009 |
| -1.190000000000081 | 0.171 | 0.034 | 0.009 |
| -1.185000000000081 | 0.173 | 0.034 | 0.009 |
| -1.180000000000081 | 0.175 | 0.034 | 0.009 |
| -1.175000000000082 | 0.176 | 0.035 | 0.009 |
| -1.170000000000082 | 0.178 | 0.035 | 0.009 |
| -1.165000000000082 | 0.18 | 0.035 | 0.009 |
| -1.160000000000082 | 0.182 | 0.035 | 0.009 |
| -1.155000000000082 | 0.184 | 0.035 | 0.009 |
| -1.150000000000082 | 0.185 | 0.035 | 0.009 |
| -1.145000000000082 | 0.187 | 0.035 | 0.009 |
| -1.140000000000082 | 0.189 | 0.036 | 0.009 |
| -1.135000000000082 | 0.191 | 0.036 | 0.009 |
| -1.130000000000082 | 0.193 | 0.036 | 0.009 |
| -1.125000000000083 | 0.195 | 0.036 | 0.009 |
| -1.120000000000083 | 0.197 | 0.036 | 0.01 |
| -1.115000000000083 | 0.199 | 0.036 | 0.01 |
| -1.110000000000083 | 0.201 | 0.037 | 0.01 |
| -1.105000000000083 | 0.203 | 0.037 | 0.01 |
| -1.100000000000083 | 0.205 | 0.037 | 0.01 |
| -1.095000000000083 | 0.207 | 0.037 | 0.01 |
| -1.090000000000083 | 0.209 | 0.037 | 0.01 |
| -1.085000000000083 | 0.211 | 0.037 | 0.01 |
| -1.080000000000084 | 0.213 | 0.037 | 0.01 |
| -1.075000000000084 | 0.215 | 0.038 | 0.01 |
| -1.070000000000084 | 0.217 | 0.038 | 0.01 |
| -1.065000000000084 | 0.22 | 0.038 | 0.01 |
| -1.060000000000084 | 0.222 | 0.038 | 0.01 |
| -1.055000000000084 | 0.224 | 0.038 | 0.01 |
| -1.050000000000084 | 0.226 | 0.038 | 0.01 |
| -1.045000000000084 | 0.228 | 0.039 | 0.01 |
| -1.040000000000084 | 0.231 | 0.039 | 0.01 |
| -1.035000000000085 | 0.233 | 0.039 | 0.01 |
| -1.030000000000085 | 0.235 | 0.039 | 0.01 |
| -1.025000000000085 | 0.238 | 0.039 | 0.01 |
| -1.020000000000085 | 0.24 | 0.039 | 0.01 |
| -1.015000000000085 | 0.243 | 0.04 | 0.01 |
| -1.010000000000085 | 0.245 | 0.04 | 0.01 |
| -1.005000000000085 | 0.248 | 0.04 | 0.01 |
| -1.000000000000085 | 0.25 | 0.04 | 0.01 |
| -0.995000000000085 | 0.253 | 0.04 | 0.01 |
| -0.990000000000085 | 0.255 | 0.04 | 0.01 |
| -0.985000000000085 | 0.258 | 0.04 | 0.01 |
| -0.980000000000085 | 0.26 | 0.041 | 0.01 |
| -0.975000000000085 | 0.263 | 0.041 | 0.01 |
| -0.970000000000085 | 0.265 | 0.041 | 0.01 |
| -0.965000000000085 | 0.268 | 0.041 | 0.01 |
| -0.960000000000085 | 0.271 | 0.041 | 0.01 |
| -0.955000000000085 | 0.274 | 0.041 | 0.01 |
| -0.950000000000085 | 0.276 | 0.042 | 0.01 |
| -0.945000000000085 | 0.279 | 0.042 | 0.01 |
| -0.940000000000085 | 0.282 | 0.042 | 0.01 |
| -0.935000000000085 | 0.285 | 0.042 | 0.01 |
| -0.930000000000085 | 0.288 | 0.042 | 0.01 |
| -0.925000000000085 | 0.29 | 0.042 | 0.01 |
| -0.920000000000085 | 0.293 | 0.043 | 0.01 |
| -0.915000000000085 | 0.296 | 0.043 | 0.01 |
| -0.910000000000085 | 0.299 | 0.043 | 0.01 |
| -0.905000000000085 | 0.302 | 0.043 | 0.01 |
| -0.900000000000085 | 0.305 | 0.043 | 0.01 |
| -0.895000000000085 | 0.308 | 0.043 | 0.01 |
| -0.890000000000085 | 0.311 | 0.044 | 0.01 |
| -0.885000000000085 | 0.314 | 0.044 | 0.01 |
| -0.880000000000085 | 0.318 | 0.044 | 0.01 |
| -0.875000000000085 | 0.321 | 0.044 | 0.01 |
| -0.870000000000085 | 0.324 | 0.044 | 0.011 |
| -0.865000000000085 | 0.327 | 0.044 | 0.011 |
| -0.860000000000085 | 0.33 | 0.045 | 0.011 |
| -0.855000000000085 | 0.334 | 0.045 | 0.011 |
| -0.850000000000085 | 0.337 | 0.045 | 0.011 |
| -0.845000000000085 | 0.34 | 0.045 | 0.011 |
| -0.840000000000085 | 0.344 | 0.045 | 0.011 |
| -0.835000000000085 | 0.347 | 0.045 | 0.011 |
| -0.830000000000085 | 0.351 | 0.045 | 0.011 |
| -0.825000000000085 | 0.354 | 0.046 | 0.011 |
| -0.820000000000085 | 0.358 | 0.046 | 0.011 |
| -0.815000000000085 | 0.361 | 0.046 | 0.011 |
| -0.810000000000085 | 0.365 | 0.046 | 0.011 |
| -0.805000000000085 | 0.368 | 0.046 | 0.011 |
| -0.800000000000085 | 0.372 | 0.046 | 0.011 |
| -0.795000000000085 | 0.375 | 0.047 | 0.011 |
| -0.790000000000085 | 0.379 | 0.047 | 0.011 |
| -0.785000000000085 | 0.383 | 0.047 | 0.011 |
| -0.780000000000085 | 0.387 | 0.047 | 0.011 |
| -0.775000000000085 | 0.39 | 0.047 | 0.011 |
| -0.770000000000085 | 0.394 | 0.047 | 0.011 |
| -0.765000000000085 | 0.398 | 0.048 | 0.011 |
| -0.760000000000085 | 0.402 | 0.048 | 0.011 |
| -0.755000000000085 | 0.406 | 0.048 | 0.011 |
| -0.750000000000085 | 0.41 | 0.048 | 0.011 |
| -0.745000000000085 | 0.414 | 0.048 | 0.011 |
| -0.740000000000085 | 0.418 | 0.048 | 0.011 |
| -0.735000000000085 | 0.422 | 0.049 | 0.011 |
| -0.730000000000085 | 0.426 | 0.049 | 0.011 |
| -0.725000000000085 | 0.43 | 0.049 | 0.011 |
| -0.720000000000085 | 0.434 | 0.049 | 0.011 |
| -0.715000000000085 | 0.438 | 0.049 | 0.011 |
| -0.710000000000085 | 0.442 | 0.049 | 0.011 |
| -0.705000000000085 | 0.446 | 0.049 | 0.011 |
| -0.700000000000085 | 0.45 | 0.05 | 0.011 |
| -0.695000000000085 | 0.455 | 0.05 | 0.011 |
| -0.690000000000085 | 0.459 | 0.05 | 0.011 |
| -0.685000000000085 | 0.463 | 0.05 | 0.011 |
| -0.680000000000085 | 0.468 | 0.05 | 0.011 |
| -0.675000000000085 | 0.472 | 0.05 | 0.011 |
| -0.670000000000085 | 0.476 | 0.051 | 0.011 |
| -0.665000000000085 | 0.481 | 0.051 | 0.011 |
| -0.660000000000085 | 0.485 | 0.051 | 0.011 |
| -0.655000000000085 | 0.49 | 0.051 | 0.011 |
| -0.650000000000085 | 0.494 | 0.051 | 0.011 |
| -0.645000000000085 | 0.499 | 0.051 | 0.011 |
| -0.640000000000085 | 0.503 | 0.051 | 0.011 |
| -0.635000000000085 | 0.508 | 0.052 | 0.011 |
| -0.630000000000085 | 0.512 | 0.052 | 0.011 |
| -0.625000000000085 | 0.517 | 0.052 | 0.011 |
| -0.620000000000085 | 0.522 | 0.052 | 0.011 |
| -0.615000000000085 | 0.526 | 0.052 | 0.011 |
| -0.610000000000085 | 0.531 | 0.052 | 0.011 |
| -0.605000000000085 | 0.536 | 0.052 | 0.011 |
| -0.600000000000085 | 0.541 | 0.053 | 0.011 |
| -0.595000000000085 | 0.545 | 0.053 | 0.011 |
| -0.590000000000085 | 0.55 | 0.053 | 0.011 |
| -0.585000000000085 | 0.555 | 0.053 | 0.011 |
| -0.580000000000085 | 0.56 | 0.053 | 0.011 |
| -0.575000000000085 | 0.565 | 0.053 | 0.011 |
| -0.570000000000085 | 0.57 | 0.053 | 0.012 |
| -0.565000000000085 | 0.575 | 0.054 | 0.012 |
| -0.560000000000085 | 0.58 | 0.054 | 0.012 |
| -0.555000000000085 | 0.584 | 0.054 | 0.012 |
| -0.550000000000085 | 0.589 | 0.054 | 0.012 |
| -0.545000000000085 | 0.594 | 0.054 | 0.012 |
| -0.540000000000085 | 0.599 | 0.054 | 0.012 |
| -0.535000000000085 | 0.604 | 0.054 | 0.012 |
| -0.530000000000085 | 0.609 | 0.055 | 0.012 |
| -0.525000000000085 | 0.615 | 0.055 | 0.012 |
| -0.520000000000085 | 0.62 | 0.055 | 0.012 |
| -0.515000000000085 | 0.625 | 0.055 | 0.012 |
| -0.510000000000085 | 0.63 | 0.055 | 0.012 |
| -0.505000000000085 | 0.635 | 0.055 | 0.012 |
| -0.500000000000085 | 0.64 | 0.055 | 0.012 |
| -0.495000000000085 | 0.645 | 0.055 | 0.012 |
| -0.490000000000085 | 0.65 | 0.056 | 0.012 |
| -0.485000000000085 | 0.655 | 0.056 | 0.012 |
| -0.480000000000085 | 0.661 | 0.056 | 0.012 |
| -0.475000000000085 | 0.666 | 0.056 | 0.012 |
| -0.470000000000085 | 0.671 | 0.056 | 0.012 |
| -0.465000000000085 | 0.676 | 0.056 | 0.012 |
| -0.460000000000085 | 0.681 | 0.056 | 0.012 |
| -0.455000000000085 | 0.686 | 0.057 | 0.012 |
| -0.450000000000085 | 0.692 | 0.057 | 0.012 |
| -0.445000000000085 | 0.697 | 0.057 | 0.012 |
| -0.440000000000085 | 0.702 | 0.057 | 0.012 |
| -0.435000000000085 | 0.707 | 0.057 | 0.012 |
| -0.430000000000085 | 0.712 | 0.057 | 0.012 |
| -0.425000000000085 | 0.717 | 0.057 | 0.012 |
| -0.420000000000085 | 0.723 | 0.057 | 0.012 |
| -0.415000000000085 | 0.728 | 0.057 | 0.012 |
| -0.410000000000085 | 0.733 | 0.058 | 0.012 |
| -0.405000000000085 | 0.738 | 0.058 | 0.012 |
| -0.400000000000085 | 0.743 | 0.058 | 0.012 |
| -0.395000000000085 | 0.748 | 0.058 | 0.012 |
| -0.390000000000085 | 0.753 | 0.058 | 0.012 |
| -0.385000000000085 | 0.758 | 0.058 | 0.012 |
| -0.380000000000085 | 0.764 | 0.058 | 0.012 |
| -0.375000000000085 | 0.769 | 0.058 | 0.012 |
| -0.370000000000085 | 0.774 | 0.058 | 0.012 |
| -0.365000000000085 | 0.779 | 0.059 | 0.012 |
| -0.360000000000085 | 0.784 | 0.059 | 0.012 |
| -0.355000000000085 | 0.789 | 0.059 | 0.012 |
| -0.350000000000085 | 0.794 | 0.059 | 0.012 |
| -0.345000000000085 | 0.799 | 0.059 | 0.012 |
| -0.340000000000085 | 0.803 | 0.059 | 0.012 |
| -0.335000000000085 | 0.808 | 0.059 | 0.012 |
| -0.330000000000085 | 0.813 | 0.059 | 0.012 |
| -0.325000000000085 | 0.818 | 0.059 | 0.012 |
| -0.320000000000085 | 0.823 | 0.059 | 0.012 |
| -0.315000000000085 | 0.828 | 0.06 | 0.012 |
| -0.310000000000085 | 0.832 | 0.06 | 0.012 |
| -0.305000000000085 | 0.837 | 0.06 | 0.012 |
| -0.300000000000085 | 0.842 | 0.06 | 0.012 |
| -0.295000000000085 | 0.846 | 0.06 | 0.012 |
| -0.290000000000085 | 0.851 | 0.06 | 0.012 |
| -0.285000000000085 | 0.855 | 0.06 | 0.012 |
| -0.280000000000085 | 0.86 | 0.06 | 0.012 |
| -0.275000000000085 | 0.864 | 0.06 | 0.012 |
| -0.270000000000085 | 0.869 | 0.06 | 0.012 |
| -0.265000000000085 | 0.873 | 0.06 | 0.012 |
| -0.260000000000085 | 0.877 | 0.06 | 0.012 |
| -0.255000000000085 | 0.882 | 0.061 | 0.012 |
| -0.250000000000085 | 0.886 | 0.061 | 0.012 |
| -0.245000000000085 | 0.89 | 0.061 | 0.012 |
| -0.240000000000085 | 0.894 | 0.061 | 0.012 |
| -0.235000000000085 | 0.898 | 0.061 | 0.012 |
| -0.230000000000085 | 0.902 | 0.061 | 0.012 |
| -0.225000000000085 | 0.906 | 0.061 | 0.012 |
| -0.220000000000085 | 0.91 | 0.061 | 0.012 |
| -0.215000000000085 | 0.914 | 0.061 | 0.012 |
| -0.210000000000085 | 0.917 | 0.061 | 0.012 |
| -0.205000000000085 | 0.921 | 0.061 | 0.012 |
| -0.200000000000085 | 0.925 | 0.061 | 0.012 |
| -0.195000000000085 | 0.928 | 0.061 | 0.012 |
| -0.190000000000085 | 0.932 | 0.061 | 0.012 |
| -0.185000000000085 | 0.935 | 0.061 | 0.012 |
| -0.180000000000085 | 0.938 | 0.061 | 0.012 |
| -0.175000000000085 | 0.941 | 0.062 | 0.012 |
| -0.170000000000085 | 0.945 | 0.062 | 0.012 |
| -0.165000000000085 | 0.948 | 0.062 | 0.012 |
| -0.160000000000085 | 0.951 | 0.062 | 0.012 |
| -0.155000000000084 | 0.954 | 0.062 | 0.012 |
| -0.150000000000084 | 0.956 | 0.062 | 0.012 |
| -0.145000000000084 | 0.959 | 0.062 | 0.012 |
| -0.140000000000084 | 0.962 | 0.062 | 0.012 |
| -0.135000000000084 | 0.965 | 0.062 | 0.012 |
| -0.130000000000084 | 0.967 | 0.062 | 0.012 |
| -0.125000000000084 | 0.969 | 0.062 | 0.012 |
| -0.120000000000084 | 0.972 | 0.062 | 0.012 |
| -0.115000000000084 | 0.974 | 0.062 | 0.012 |
| -0.110000000000084 | 0.976 | 0.062 | 0.012 |
| -0.105000000000084 | 0.978 | 0.062 | 0.012 |
| -0.100000000000084 | 0.98 | 0.062 | 0.012 |
| -0.0950000000000844 | 0.982 | 0.062 | 0.012 |
| -0.0900000000000844 | 0.984 | 0.062 | 0.012 |
| -0.0850000000000844 | 0.986 | 0.062 | 0.012 |
| -0.0800000000000844 | 0.987 | 0.062 | 0.012 |
| -0.0750000000000844 | 0.989 | 0.062 | 0.012 |
| -0.0700000000000844 | 0.99 | 0.062 | 0.012 |
| -0.0650000000000844 | 0.992 | 0.062 | 0.012 |
| -0.0600000000000844 | 0.993 | 0.062 | 0.012 |
| -0.0550000000000844 | 0.994 | 0.062 | 0.012 |
| -0.0500000000000844 | 0.995 | 0.062 | 0.012 |
| -0.0450000000000844 | 0.996 | 0.062 | 0.012 |
| -0.0400000000000844 | 0.997 | 0.062 | 0.012 |
| -0.0350000000000844 | 0.998 | 0.062 | 0.012 |
| -0.0300000000000844 | 0.998 | 0.062 | 0.012 |
| -0.0250000000000844 | 0.999 | 0.062 | 0.012 |
| -0.0200000000000844 | 0.999 | 0.062 | 0.012 |
| -0.0150000000000844 | 1 | 0.062 | 0.012 |
| -0.0100000000000844 | 1 | 0.062 | 0.012 |
| -0.00500000000008444 | 1 | 0.062 | 0.012 |
| -8.4444604087075e-14 | 1 | 0.062 | 0.012 |
| 0.00499999999991555 | 1 | 0.062 | 0.012 |
| 0.00999999999991555 | 1 | 0.062 | 0.012 |
| 0.0149999999999156 | 1 | 0.062 | 0.012 |
| 0.0199999999999156 | 0.999 | 0.062 | 0.012 |
| 0.0249999999999156 | 0.999 | 0.062 | 0.012 |
| 0.0299999999999156 | 0.998 | 0.062 | 0.012 |
| 0.0349999999999155 | 0.998 | 0.062 | 0.012 |
| 0.0399999999999155 | 0.997 | 0.062 | 0.012 |
| 0.0449999999999155 | 0.996 | 0.062 | 0.012 |
| 0.0499999999999155 | 0.995 | 0.062 | 0.012 |
| 0.0549999999999155 | 0.994 | 0.062 | 0.012 |
| 0.0599999999999155 | 0.993 | 0.062 | 0.012 |
| 0.0649999999999155 | 0.992 | 0.062 | 0.012 |
| 0.0699999999999155 | 0.99 | 0.062 | 0.012 |
| 0.0749999999999155 | 0.989 | 0.062 | 0.012 |
| 0.0799999999999155 | 0.987 | 0.062 | 0.012 |
| 0.0849999999999155 | 0.986 | 0.062 | 0.012 |
| 0.0899999999999155 | 0.984 | 0.062 | 0.012 |
| 0.0949999999999155 | 0.982 | 0.062 | 0.012 |
| 0.0999999999999155 | 0.98 | 0.062 | 0.012 |
| 0.104999999999916 | 0.978 | 0.062 | 0.012 |
| 0.109999999999916 | 0.976 | 0.062 | 0.012 |
| 0.114999999999916 | 0.974 | 0.062 | 0.012 |
| 0.119999999999916 | 0.972 | 0.062 | 0.012 |
| 0.124999999999916 | 0.969 | 0.062 | 0.012 |
| 0.129999999999916 | 0.967 | 0.062 | 0.012 |
| 0.134999999999916 | 0.965 | 0.062 | 0.012 |
| 0.139999999999916 | 0.962 | 0.062 | 0.012 |
| 0.144999999999916 | 0.959 | 0.062 | 0.012 |
| 0.149999999999916 | 0.956 | 0.062 | 0.012 |
| 0.154999999999916 | 0.954 | 0.062 | 0.012 |
| 0.159999999999916 | 0.951 | 0.062 | 0.012 |
| 0.164999999999916 | 0.948 | 0.062 | 0.012 |
| 0.169999999999916 | 0.945 | 0.062 | 0.012 |
| 0.174999999999916 | 0.941 | 0.062 | 0.012 |
| 0.179999999999916 | 0.938 | 0.061 | 0.012 |
| 0.184999999999916 | 0.935 | 0.061 | 0.012 |
| 0.189999999999916 | 0.932 | 0.061 | 0.012 |
| 0.194999999999916 | 0.928 | 0.061 | 0.012 |
| 0.199999999999916 | 0.925 | 0.061 | 0.012 |
| 0.204999999999916 | 0.921 | 0.061 | 0.012 |
| 0.209999999999916 | 0.917 | 0.061 | 0.012 |
| 0.214999999999916 | 0.914 | 0.061 | 0.012 |
| 0.219999999999916 | 0.91 | 0.061 | 0.012 |
| 0.224999999999916 | 0.906 | 0.061 | 0.012 |
| 0.229999999999916 | 0.902 | 0.061 | 0.012 |
| 0.234999999999916 | 0.898 | 0.061 | 0.012 |
| 0.239999999999916 | 0.894 | 0.061 | 0.012 |
| 0.244999999999916 | 0.89 | 0.061 | 0.012 |
| 0.249999999999916 | 0.886 | 0.061 | 0.012 |
| 0.254999999999916 | 0.882 | 0.061 | 0.012 |
| 0.259999999999916 | 0.877 | 0.06 | 0.012 |
| 0.264999999999916 | 0.873 | 0.06 | 0.012 |
| 0.269999999999916 | 0.869 | 0.06 | 0.012 |
| 0.274999999999916 | 0.864 | 0.06 | 0.012 |
| 0.279999999999916 | 0.86 | 0.06 | 0.012 |
| 0.284999999999916 | 0.855 | 0.06 | 0.012 |
| 0.289999999999916 | 0.851 | 0.06 | 0.012 |
| 0.294999999999916 | 0.846 | 0.06 | 0.012 |
| 0.299999999999916 | 0.842 | 0.06 | 0.012 |
| 0.304999999999916 | 0.837 | 0.06 | 0.012 |
| 0.309999999999916 | 0.832 | 0.06 | 0.012 |
| 0.314999999999916 | 0.828 | 0.06 | 0.012 |
| 0.319999999999916 | 0.823 | 0.059 | 0.012 |
| 0.324999999999916 | 0.818 | 0.059 | 0.012 |
| 0.329999999999916 | 0.813 | 0.059 | 0.012 |
| 0.334999999999916 | 0.808 | 0.059 | 0.012 |
| 0.339999999999916 | 0.803 | 0.059 | 0.012 |
| 0.344999999999916 | 0.799 | 0.059 | 0.012 |
| 0.349999999999916 | 0.794 | 0.059 | 0.012 |
| 0.354999999999916 | 0.789 | 0.059 | 0.012 |
| 0.359999999999916 | 0.784 | 0.059 | 0.012 |
| 0.364999999999916 | 0.779 | 0.059 | 0.012 |
| 0.369999999999916 | 0.774 | 0.058 | 0.012 |
| 0.374999999999916 | 0.769 | 0.058 | 0.012 |
| 0.379999999999916 | 0.764 | 0.058 | 0.012 |
| 0.384999999999916 | 0.758 | 0.058 | 0.012 |
| 0.389999999999916 | 0.753 | 0.058 | 0.012 |
| 0.394999999999916 | 0.748 | 0.058 | 0.012 |
| 0.399999999999916 | 0.743 | 0.058 | 0.012 |
| 0.404999999999916 | 0.738 | 0.058 | 0.012 |
| 0.409999999999916 | 0.733 | 0.058 | 0.012 |
| 0.414999999999916 | 0.728 | 0.057 | 0.012 |
| 0.419999999999916 | 0.723 | 0.057 | 0.012 |
| 0.424999999999916 | 0.717 | 0.057 | 0.012 |
| 0.429999999999916 | 0.712 | 0.057 | 0.012 |
| 0.434999999999916 | 0.707 | 0.057 | 0.012 |
| 0.439999999999916 | 0.702 | 0.057 | 0.012 |
| 0.444999999999916 | 0.697 | 0.057 | 0.012 |
| 0.449999999999916 | 0.692 | 0.057 | 0.012 |
| 0.454999999999916 | 0.686 | 0.057 | 0.012 |
| 0.459999999999916 | 0.681 | 0.056 | 0.012 |
| 0.464999999999916 | 0.676 | 0.056 | 0.012 |
| 0.469999999999916 | 0.671 | 0.056 | 0.012 |
| 0.474999999999916 | 0.666 | 0.056 | 0.012 |
| 0.479999999999916 | 0.661 | 0.056 | 0.012 |
| 0.484999999999916 | 0.655 | 0.056 | 0.012 |
| 0.489999999999916 | 0.65 | 0.056 | 0.012 |
| 0.494999999999916 | 0.645 | 0.055 | 0.012 |
| 0.499999999999916 | 0.64 | 0.055 | 0.012 |
| 0.504999999999916 | 0.635 | 0.055 | 0.012 |
| 0.509999999999916 | 0.63 | 0.055 | 0.012 |
| 0.514999999999916 | 0.625 | 0.055 | 0.012 |
| 0.519999999999916 | 0.62 | 0.055 | 0.012 |
| 0.524999999999916 | 0.615 | 0.055 | 0.012 |
| 0.529999999999916 | 0.609 | 0.055 | 0.012 |
| 0.534999999999916 | 0.604 | 0.054 | 0.012 |
| 0.539999999999916 | 0.599 | 0.054 | 0.012 |
| 0.544999999999916 | 0.594 | 0.054 | 0.012 |
| 0.549999999999916 | 0.589 | 0.054 | 0.012 |
| 0.554999999999916 | 0.584 | 0.054 | 0.012 |
| 0.559999999999916 | 0.58 | 0.054 | 0.012 |
| 0.564999999999916 | 0.575 | 0.054 | 0.012 |
| 0.569999999999916 | 0.57 | 0.053 | 0.012 |
| 0.574999999999916 | 0.565 | 0.053 | 0.011 |
| 0.579999999999916 | 0.56 | 0.053 | 0.011 |
| 0.584999999999916 | 0.555 | 0.053 | 0.011 |
| 0.589999999999916 | 0.55 | 0.053 | 0.011 |
| 0.594999999999916 | 0.545 | 0.053 | 0.011 |
| 0.599999999999916 | 0.541 | 0.053 | 0.011 |
| 0.604999999999916 | 0.536 | 0.052 | 0.011 |
| 0.609999999999916 | 0.531 | 0.052 | 0.011 |
| 0.614999999999916 | 0.526 | 0.052 | 0.011 |
| 0.619999999999916 | 0.522 | 0.052 | 0.011 |
| 0.624999999999916 | 0.517 | 0.052 | 0.011 |
| 0.629999999999916 | 0.512 | 0.052 | 0.011 |
| 0.634999999999916 | 0.508 | 0.052 | 0.011 |
| 0.639999999999916 | 0.503 | 0.051 | 0.011 |
| 0.644999999999916 | 0.499 | 0.051 | 0.011 |
| 0.649999999999916 | 0.494 | 0.051 | 0.011 |
| 0.654999999999916 | 0.49 | 0.051 | 0.011 |
| 0.659999999999916 | 0.485 | 0.051 | 0.011 |
| 0.664999999999916 | 0.481 | 0.051 | 0.011 |
| 0.669999999999916 | 0.476 | 0.051 | 0.011 |
| 0.674999999999916 | 0.472 | 0.05 | 0.011 |
| 0.679999999999916 | 0.468 | 0.05 | 0.011 |
| 0.684999999999916 | 0.463 | 0.05 | 0.011 |
| 0.689999999999916 | 0.459 | 0.05 | 0.011 |
| 0.694999999999916 | 0.455 | 0.05 | 0.011 |
| 0.699999999999916 | 0.45 | 0.05 | 0.011 |
| 0.704999999999916 | 0.446 | 0.049 | 0.011 |
| 0.709999999999916 | 0.442 | 0.049 | 0.011 |
| 0.714999999999916 | 0.438 | 0.049 | 0.011 |
| 0.719999999999916 | 0.434 | 0.049 | 0.011 |
| 0.724999999999916 | 0.43 | 0.049 | 0.011 |
| 0.729999999999916 | 0.426 | 0.049 | 0.011 |
| 0.734999999999916 | 0.422 | 0.049 | 0.011 |
| 0.739999999999916 | 0.418 | 0.048 | 0.011 |
| 0.744999999999916 | 0.414 | 0.048 | 0.011 |
| 0.749999999999916 | 0.41 | 0.048 | 0.011 |
| 0.754999999999916 | 0.406 | 0.048 | 0.011 |
| 0.759999999999916 | 0.402 | 0.048 | 0.011 |
| 0.764999999999916 | 0.398 | 0.048 | 0.011 |
| 0.769999999999916 | 0.394 | 0.047 | 0.011 |
| 0.774999999999916 | 0.39 | 0.047 | 0.011 |
| 0.779999999999916 | 0.387 | 0.047 | 0.011 |
| 0.784999999999916 | 0.383 | 0.047 | 0.011 |
| 0.789999999999916 | 0.379 | 0.047 | 0.011 |
| 0.794999999999916 | 0.375 | 0.047 | 0.011 |
| 0.799999999999916 | 0.372 | 0.046 | 0.011 |
| 0.804999999999916 | 0.368 | 0.046 | 0.011 |
| 0.809999999999916 | 0.365 | 0.046 | 0.011 |
| 0.814999999999916 | 0.361 | 0.046 | 0.011 |
| 0.819999999999916 | 0.358 | 0.046 | 0.011 |
| 0.824999999999916 | 0.354 | 0.046 | 0.011 |
| 0.829999999999916 | 0.351 | 0.045 | 0.011 |
| 0.834999999999916 | 0.347 | 0.045 | 0.011 |
| 0.839999999999916 | 0.344 | 0.045 | 0.011 |
| 0.844999999999916 | 0.34 | 0.045 | 0.011 |
| 0.849999999999916 | 0.337 | 0.045 | 0.011 |
| 0.854999999999916 | 0.334 | 0.045 | 0.011 |
| 0.859999999999916 | 0.33 | 0.045 | 0.011 |
| 0.864999999999916 | 0.327 | 0.044 | 0.011 |
| 0.869999999999916 | 0.324 | 0.044 | 0.011 |
| 0.874999999999916 | 0.321 | 0.044 | 0.01 |
| 0.879999999999916 | 0.318 | 0.044 | 0.01 |
| 0.884999999999916 | 0.314 | 0.044 | 0.01 |
| 0.889999999999916 | 0.311 | 0.044 | 0.01 |
| 0.894999999999916 | 0.308 | 0.043 | 0.01 |
| 0.899999999999916 | 0.305 | 0.043 | 0.01 |
| 0.904999999999916 | 0.302 | 0.043 | 0.01 |
| 0.909999999999916 | 0.299 | 0.043 | 0.01 |
| 0.914999999999916 | 0.296 | 0.043 | 0.01 |
| 0.919999999999916 | 0.293 | 0.043 | 0.01 |
| 0.924999999999916 | 0.29 | 0.042 | 0.01 |
| 0.929999999999916 | 0.288 | 0.042 | 0.01 |
| 0.934999999999916 | 0.285 | 0.042 | 0.01 |
| 0.939999999999916 | 0.282 | 0.042 | 0.01 |
| 0.944999999999916 | 0.279 | 0.042 | 0.01 |
| 0.949999999999916 | 0.276 | 0.042 | 0.01 |
| 0.954999999999916 | 0.274 | 0.041 | 0.01 |
| 0.959999999999916 | 0.271 | 0.041 | 0.01 |
| 0.964999999999916 | 0.268 | 0.041 | 0.01 |
| 0.969999999999916 | 0.265 | 0.041 | 0.01 |
| 0.974999999999916 | 0.263 | 0.041 | 0.01 |
| 0.979999999999916 | 0.26 | 0.041 | 0.01 |
| 0.984999999999916 | 0.258 | 0.04 | 0.01 |
| 0.989999999999916 | 0.255 | 0.04 | 0.01 |
| 0.994999999999916 | 0.253 | 0.04 | 0.01 |
| 0.999999999999916 | 0.25 | 0.04 | 0.01 |
| 1.004999999999916 | 0.248 | 0.04 | 0.01 |
| 1.009999999999916 | 0.245 | 0.04 | 0.01 |
| 1.014999999999916 | 0.243 | 0.04 | 0.01 |
| 1.019999999999916 | 0.24 | 0.039 | 0.01 |
| 1.024999999999916 | 0.238 | 0.039 | 0.01 |
| 1.029999999999916 | 0.235 | 0.039 | 0.01 |
| 1.034999999999916 | 0.233 | 0.039 | 0.01 |
| 1.039999999999915 | 0.231 | 0.039 | 0.01 |
| 1.044999999999915 | 0.228 | 0.039 | 0.01 |
| 1.049999999999915 | 0.226 | 0.038 | 0.01 |
| 1.054999999999915 | 0.224 | 0.038 | 0.01 |
| 1.059999999999915 | 0.222 | 0.038 | 0.01 |
| 1.064999999999915 | 0.22 | 0.038 | 0.01 |
| 1.069999999999915 | 0.217 | 0.038 | 0.01 |
| 1.074999999999915 | 0.215 | 0.038 | 0.01 |
| 1.079999999999915 | 0.213 | 0.037 | 0.01 |
| 1.084999999999914 | 0.211 | 0.037 | 0.01 |
| 1.089999999999914 | 0.209 | 0.037 | 0.01 |
| 1.094999999999914 | 0.207 | 0.037 | 0.01 |
| 1.099999999999914 | 0.205 | 0.037 | 0.01 |
| 1.104999999999914 | 0.203 | 0.037 | 0.01 |
| 1.109999999999914 | 0.201 | 0.037 | 0.01 |
| 1.114999999999914 | 0.199 | 0.036 | 0.01 |
| 1.119999999999914 | 0.197 | 0.036 | 0.01 |
| 1.124999999999914 | 0.195 | 0.036 | 0.009 |
| 1.129999999999914 | 0.193 | 0.036 | 0.009 |
| 1.134999999999913 | 0.191 | 0.036 | 0.009 |
| 1.139999999999913 | 0.189 | 0.036 | 0.009 |
| 1.144999999999913 | 0.187 | 0.035 | 0.009 |
| 1.149999999999913 | 0.185 | 0.035 | 0.009 |
| 1.154999999999913 | 0.184 | 0.035 | 0.009 |
| 1.159999999999913 | 0.182 | 0.035 | 0.009 |
| 1.164999999999913 | 0.18 | 0.035 | 0.009 |
| 1.169999999999913 | 0.178 | 0.035 | 0.009 |
| 1.174999999999913 | 0.176 | 0.035 | 0.009 |
| 1.179999999999912 | 0.175 | 0.034 | 0.009 |
| 1.184999999999912 | 0.173 | 0.034 | 0.009 |
| 1.189999999999912 | 0.171 | 0.034 | 0.009 |
| 1.194999999999912 | 0.17 | 0.034 | 0.009 |
| 1.199999999999912 | 0.168 | 0.034 | 0.009 |
| 1.204999999999912 | 0.166 | 0.034 | 0.009 |
| 1.209999999999912 | 0.165 | 0.033 | 0.009 |
| 1.214999999999912 | 0.163 | 0.033 | 0.009 |
| 1.219999999999912 | 0.161 | 0.033 | 0.009 |
| 1.224999999999911 | 0.16 | 0.033 | 0.009 |
| 1.229999999999911 | 0.158 | 0.033 | 0.009 |
| 1.234999999999911 | 0.157 | 0.033 | 0.009 |
| 1.239999999999911 | 0.155 | 0.033 | 0.009 |
| 1.244999999999911 | 0.154 | 0.032 | 0.009 |
| 1.249999999999911 | 0.152 | 0.032 | 0.009 |
| 1.254999999999911 | 0.151 | 0.032 | 0.009 |
| 1.259999999999911 | 0.149 | 0.032 | 0.009 |
| 1.264999999999911 | 0.148 | 0.032 | 0.009 |
| 1.269999999999911 | 0.146 | 0.032 | 0.009 |
| 1.27499999999991 | 0.145 | 0.032 | 0.009 |
| 1.27999999999991 | 0.144 | 0.031 | 0.009 |
| 1.28499999999991 | 0.142 | 0.031 | 0.009 |
| 1.28999999999991 | 0.141 | 0.031 | 0.009 |
| 1.29499999999991 | 0.14 | 0.031 | 0.009 |
| 1.29999999999991 | 0.138 | 0.031 | 0.009 |
| 1.30499999999991 | 0.137 | 0.031 | 0.009 |
| 1.30999999999991 | 0.136 | 0.031 | 0.009 |
| 1.31499999999991 | 0.134 | 0.03 | 0.009 |
| 1.319999999999909 | 0.133 | 0.03 | 0.009 |
| 1.324999999999909 | 0.132 | 0.03 | 0.009 |
| 1.329999999999909 | 0.13 | 0.03 | 0.009 |
| 1.334999999999909 | 0.129 | 0.03 | 0.009 |
| 1.339999999999909 | 0.128 | 0.03 | 0.009 |
| 1.344999999999909 | 0.127 | 0.03 | 0.009 |
| 1.349999999999909 | 0.126 | 0.029 | 0.009 |
| 1.354999999999909 | 0.124 | 0.029 | 0.009 |
| 1.359999999999909 | 0.123 | 0.029 | 0.008 |
| 1.364999999999908 | 0.122 | 0.029 | 0.008 |
| 1.369999999999908 | 0.121 | 0.029 | 0.008 |
| 1.374999999999908 | 0.12 | 0.029 | 0.008 |
| 1.379999999999908 | 0.119 | 0.029 | 0.008 |
| 1.384999999999908 | 0.117 | 0.029 | 0.008 |
| 1.389999999999908 | 0.116 | 0.028 | 0.008 |
| 1.394999999999908 | 0.115 | 0.028 | 0.008 |
| 1.399999999999908 | 0.114 | 0.028 | 0.008 |
| 1.404999999999908 | 0.113 | 0.028 | 0.008 |
| 1.409999999999908 | 0.112 | 0.028 | 0.008 |
| 1.414999999999907 | 0.111 | 0.028 | 0.008 |
| 1.419999999999907 | 0.11 | 0.028 | 0.008 |
| 1.424999999999907 | 0.109 | 0.027 | 0.008 |
| 1.429999999999907 | 0.108 | 0.027 | 0.008 |
| 1.434999999999907 | 0.107 | 0.027 | 0.008 |
| 1.439999999999907 | 0.106 | 0.027 | 0.008 |
| 1.444999999999907 | 0.105 | 0.027 | 0.008 |
| 1.449999999999907 | 0.104 | 0.027 | 0.008 |
| 1.454999999999907 | 0.103 | 0.027 | 0.008 |
| 1.459999999999906 | 0.102 | 0.027 | 0.008 |
| 1.464999999999906 | 0.101 | 0.026 | 0.008 |
| 1.469999999999906 | 0.1 | 0.026 | 0.008 |
| 1.474999999999906 | 0.099 | 0.026 | 0.008 |
| 1.479999999999906 | 0.098 | 0.026 | 0.008 |
| 1.484999999999906 | 0.097 | 0.026 | 0.008 |
| 1.489999999999906 | 0.096 | 0.026 | 0.008 |
| 1.494999999999906 | 0.096 | 0.026 | 0.008 |
| 1.499999999999906 | 0.095 | 0.026 | 0.008 |
| 1.504999999999906 | 0.094 | 0.025 | 0.008 |
| 1.509999999999905 | 0.093 | 0.025 | 0.008 |
| 1.514999999999905 | 0.092 | 0.025 | 0.008 |
| 1.519999999999905 | 0.091 | 0.025 | 0.008 |
| 1.524999999999905 | 0.09 | 0.025 | 0.008 |
| 1.529999999999905 | 0.09 | 0.025 | 0.008 |
| 1.534999999999905 | 0.089 | 0.025 | 0.008 |
| 1.539999999999905 | 0.088 | 0.025 | 0.008 |
| 1.544999999999905 | 0.087 | 0.025 | 0.008 |
| 1.549999999999905 | 0.086 | 0.024 | 0.008 |
| 1.554999999999904 | 0.086 | 0.024 | 0.008 |
| 1.559999999999904 | 0.085 | 0.024 | 0.008 |
| 1.564999999999904 | 0.084 | 0.024 | 0.008 |
| 1.569999999999904 | 0.083 | 0.024 | 0.008 |
| 1.574999999999904 | 0.083 | 0.024 | 0.008 |
| 1.579999999999904 | 0.082 | 0.024 | 0.008 |
| 1.584999999999904 | 0.081 | 0.024 | 0.008 |
| 1.589999999999904 | 0.08 | 0.023 | 0.008 |
| 1.594999999999904 | 0.08 | 0.023 | 0.008 |
| 1.599999999999903 | 0.079 | 0.023 | 0.007 |
| 1.604999999999903 | 0.078 | 0.023 | 0.007 |
| 1.609999999999903 | 0.078 | 0.023 | 0.007 |
| 1.614999999999903 | 0.077 | 0.023 | 0.007 |
| 1.619999999999903 | 0.076 | 0.023 | 0.007 |
| 1.624999999999903 | 0.075 | 0.023 | 0.007 |
| 1.629999999999903 | 0.075 | 0.023 | 0.007 |
| 1.634999999999903 | 0.074 | 0.022 | 0.007 |
| 1.639999999999903 | 0.073 | 0.022 | 0.007 |
| 1.644999999999902 | 0.073 | 0.022 | 0.007 |
| 1.649999999999902 | 0.072 | 0.022 | 0.007 |
| 1.654999999999902 | 0.072 | 0.022 | 0.007 |
| 1.659999999999902 | 0.071 | 0.022 | 0.007 |
| 1.664999999999902 | 0.07 | 0.022 | 0.007 |
| 1.669999999999902 | 0.07 | 0.022 | 0.007 |
| 1.674999999999902 | 0.069 | 0.022 | 0.007 |
| 1.679999999999902 | 0.068 | 0.021 | 0.007 |
| 1.684999999999902 | 0.068 | 0.021 | 0.007 |
| 1.689999999999901 | 0.067 | 0.021 | 0.007 |
| 1.694999999999901 | 0.067 | 0.021 | 0.007 |
| 1.699999999999901 | 0.066 | 0.021 | 0.007 |
| 1.704999999999901 | 0.066 | 0.021 | 0.007 |
| 1.709999999999901 | 0.065 | 0.021 | 0.007 |
| 1.714999999999901 | 0.064 | 0.021 | 0.007 |
| 1.719999999999901 | 0.064 | 0.021 | 0.007 |
| 1.724999999999901 | 0.063 | 0.021 | 0.007 |
| 1.729999999999901 | 0.063 | 0.02 | 0.007 |
| 1.734999999999901 | 0.062 | 0.02 | 0.007 |
| 1.7399999999999 | 0.062 | 0.02 | 0.007 |
| 1.7449999999999 | 0.061 | 0.02 | 0.007 |
| 1.7499999999999 | 0.061 | 0.02 | 0.007 |
| 1.7549999999999 | 0.06 | 0.02 | 0.007 |
| 1.7599999999999 | 0.06 | 0.02 | 0.007 |
| 1.7649999999999 | 0.059 | 0.02 | 0.007 |
| 1.7699999999999 | 0.059 | 0.02 | 0.007 |
| 1.7749999999999 | 0.058 | 0.02 | 0.007 |
| 1.7799999999999 | 0.058 | 0.019 | 0.007 |
| 1.784999999999899 | 0.057 | 0.019 | 0.007 |
| 1.789999999999899 | 0.057 | 0.019 | 0.007 |
| 1.794999999999899 | 0.056 | 0.019 | 0.007 |
| 1.799999999999899 | 0.056 | 0.019 | 0.007 |
| 1.804999999999899 | 0.055 | 0.019 | 0.007 |
| 1.809999999999899 | 0.055 | 0.019 | 0.007 |
| 1.814999999999899 | 0.054 | 0.019 | 0.007 |
| 1.819999999999899 | 0.054 | 0.019 | 0.007 |
| 1.824999999999899 | 0.053 | 0.019 | 0.007 |
| 1.829999999999899 | 0.053 | 0.019 | 0.007 |
| 1.834999999999898 | 0.052 | 0.018 | 0.007 |
| 1.839999999999898 | 0.052 | 0.018 | 0.007 |
| 1.844999999999898 | 0.052 | 0.018 | 0.006 |
| 1.849999999999898 | 0.051 | 0.018 | 0.006 |
| 1.854999999999898 | 0.051 | 0.018 | 0.006 |
| 1.859999999999898 | 0.05 | 0.018 | 0.006 |
| 1.864999999999898 | 0.05 | 0.018 | 0.006 |
| 1.869999999999898 | 0.049 | 0.018 | 0.006 |
| 1.874999999999898 | 0.049 | 0.018 | 0.006 |
| 1.879999999999897 | 0.049 | 0.018 | 0.006 |
| 1.884999999999897 | 0.048 | 0.018 | 0.006 |
| 1.889999999999897 | 0.048 | 0.017 | 0.006 |
| 1.894999999999897 | 0.047 | 0.017 | 0.006 |
| 1.899999999999897 | 0.047 | 0.017 | 0.006 |
| 1.904999999999897 | 0.047 | 0.017 | 0.006 |
| 1.909999999999897 | 0.046 | 0.017 | 0.006 |
| 1.914999999999897 | 0.046 | 0.017 | 0.006 |
| 1.919999999999897 | 0.046 | 0.017 | 0.006 |
| 1.924999999999897 | 0.045 | 0.017 | 0.006 |
| 1.929999999999896 | 0.045 | 0.017 | 0.006 |
| 1.934999999999896 | 0.044 | 0.017 | 0.006 |
| 1.939999999999896 | 0.044 | 0.017 | 0.006 |
| 1.944999999999896 | 0.044 | 0.017 | 0.006 |
| 1.949999999999896 | 0.043 | 0.016 | 0.006 |
| 1.954999999999896 | 0.043 | 0.016 | 0.006 |
| 1.959999999999896 | 0.043 | 0.016 | 0.006 |
| 1.964999999999896 | 0.042 | 0.016 | 0.006 |
| 1.969999999999896 | 0.042 | 0.016 | 0.006 |
| 1.974999999999895 | 0.042 | 0.016 | 0.006 |
| 1.979999999999895 | 0.041 | 0.016 | 0.006 |
| 1.984999999999895 | 0.041 | 0.016 | 0.006 |
| 1.989999999999895 | 0.041 | 0.016 | 0.006 |
| 1.994999999999895 | 0.04 | 0.016 | 0.006 |
| 1.999999999999895 | 0.04 | 0.016 | 0.006 |
| 2.004999999999895 | 0.04 | 0.016 | 0.006 |
| 2.009999999999895 | 0.039 | 0.015 | 0.006 |
| 2.014999999999895 | 0.039 | 0.015 | 0.006 |
| 2.019999999999895 | 0.039 | 0.015 | 0.006 |
| 2.024999999999895 | 0.038 | 0.015 | 0.006 |
| 2.029999999999895 | 0.038 | 0.015 | 0.006 |
| 2.034999999999894 | 0.038 | 0.015 | 0.006 |
| 2.039999999999894 | 0.038 | 0.015 | 0.006 |
| 2.044999999999894 | 0.037 | 0.015 | 0.006 |
| 2.049999999999894 | 0.037 | 0.015 | 0.006 |
| 2.054999999999894 | 0.037 | 0.015 | 0.006 |
| 2.059999999999894 | 0.036 | 0.015 | 0.006 |
| 2.064999999999894 | 0.036 | 0.015 | 0.006 |
| 2.069999999999894 | 0.036 | 0.015 | 0.006 |
| 2.074999999999894 | 0.036 | 0.014 | 0.006 |
| 2.079999999999893 | 0.035 | 0.014 | 0.006 |
| 2.084999999999893 | 0.035 | 0.014 | 0.006 |
| 2.089999999999893 | 0.035 | 0.014 | 0.006 |
| 2.094999999999893 | 0.034 | 0.014 | 0.006 |
| 2.099999999999893 | 0.034 | 0.014 | 0.006 |
| 2.104999999999893 | 0.034 | 0.014 | 0.006 |
| 2.109999999999893 | 0.034 | 0.014 | 0.006 |
| 2.114999999999893 | 0.033 | 0.014 | 0.006 |
| 2.119999999999893 | 0.033 | 0.014 | 0.005 |
| 2.124999999999893 | 0.033 | 0.014 | 0.005 |
| 2.129999999999892 | 0.033 | 0.014 | 0.005 |
| 2.134999999999892 | 0.032 | 0.014 | 0.005 |
| 2.139999999999892 | 0.032 | 0.014 | 0.005 |
| 2.144999999999892 | 0.032 | 0.014 | 0.005 |
| 2.149999999999892 | 0.032 | 0.013 | 0.005 |
| 2.154999999999892 | 0.031 | 0.013 | 0.005 |
| 2.159999999999892 | 0.031 | 0.013 | 0.005 |
| 2.164999999999892 | 0.031 | 0.013 | 0.005 |
| 2.169999999999892 | 0.031 | 0.013 | 0.005 |
| 2.174999999999891 | 0.03 | 0.013 | 0.005 |
| 2.179999999999891 | 0.03 | 0.013 | 0.005 |
| 2.184999999999891 | 0.03 | 0.013 | 0.005 |
| 2.189999999999891 | 0.03 | 0.013 | 0.005 |
| 2.194999999999891 | 0.03 | 0.013 | 0.005 |
| 2.199999999999891 | 0.029 | 0.013 | 0.005 |
| 2.204999999999891 | 0.029 | 0.013 | 0.005 |
| 2.209999999999891 | 0.029 | 0.013 | 0.005 |
| 2.214999999999891 | 0.029 | 0.013 | 0.005 |
| 2.21999999999989 | 0.028 | 0.013 | 0.005 |
| 2.22499999999989 | 0.028 | 0.012 | 0.005 |
| 2.22999999999989 | 0.028 | 0.012 | 0.005 |
| 2.23499999999989 | 0.028 | 0.012 | 0.005 |
| 2.23999999999989 | 0.028 | 0.012 | 0.005 |
| 2.24499999999989 | 0.027 | 0.012 | 0.005 |
| 2.24999999999989 | 0.027 | 0.012 | 0.005 |
| 2.25499999999989 | 0.027 | 0.012 | 0.005 |
| 2.25999999999989 | 0.027 | 0.012 | 0.005 |
| 2.26499999999989 | 0.027 | 0.012 | 0.005 |
| 2.269999999999889 | 0.026 | 0.012 | 0.005 |
| 2.274999999999889 | 0.026 | 0.012 | 0.005 |
| 2.279999999999889 | 0.026 | 0.012 | 0.005 |
| 2.284999999999889 | 0.026 | 0.012 | 0.005 |
| 2.289999999999889 | 0.026 | 0.012 | 0.005 |
| 2.294999999999889 | 0.025 | 0.012 | 0.005 |
| 2.299999999999889 | 0.025 | 0.012 | 0.005 |
| 2.304999999999889 | 0.025 | 0.012 | 0.005 |
| 2.309999999999889 | 0.025 | 0.011 | 0.005 |
| 2.314999999999888 | 0.025 | 0.011 | 0.005 |
| 2.319999999999888 | 0.025 | 0.011 | 0.005 |
| 2.324999999999888 | 0.024 | 0.011 | 0.005 |
| 2.329999999999888 | 0.024 | 0.011 | 0.005 |
| 2.334999999999888 | 0.024 | 0.011 | 0.005 |
| 2.339999999999888 | 0.024 | 0.011 | 0.005 |
| 2.344999999999888 | 0.024 | 0.011 | 0.005 |
| 2.349999999999888 | 0.024 | 0.011 | 0.005 |
| 2.354999999999888 | 0.023 | 0.011 | 0.005 |
| 2.359999999999887 | 0.023 | 0.011 | 0.005 |
| 2.364999999999887 | 0.023 | 0.011 | 0.005 |
| 2.369999999999887 | 0.023 | 0.011 | 0.005 |
| 2.374999999999887 | 0.023 | 0.011 | 0.005 |
| 2.379999999999887 | 0.023 | 0.011 | 0.005 |
| 2.384999999999887 | 0.022 | 0.011 | 0.005 |
| 2.389999999999887 | 0.022 | 0.011 | 0.005 |
| 2.394999999999887 | 0.022 | 0.011 | 0.005 |
| 2.399999999999887 | 0.022 | 0.01 | 0.005 |
| 2.404999999999887 | 0.022 | 0.01 | 0.005 |
| 2.409999999999886 | 0.022 | 0.01 | 0.005 |
| 2.414999999999886 | 0.021 | 0.01 | 0.005 |
| 2.419999999999886 | 0.021 | 0.01 | 0.005 |
| 2.424999999999886 | 0.021 | 0.01 | 0.005 |
| 2.429999999999886 | 0.021 | 0.01 | 0.005 |
| 2.434999999999886 | 0.021 | 0.01 | 0.004 |
| 2.439999999999886 | 0.021 | 0.01 | 0.004 |
| 2.444999999999886 | 0.021 | 0.01 | 0.004 |
| 2.449999999999886 | 0.02 | 0.01 | 0.004 |
| 2.454999999999885 | 0.02 | 0.01 | 0.004 |
| 2.459999999999885 | 0.02 | 0.01 | 0.004 |
| 2.464999999999885 | 0.02 | 0.01 | 0.004 |
| 2.469999999999885 | 0.02 | 0.01 | 0.004 |
| 2.474999999999885 | 0.02 | 0.01 | 0.004 |
| 2.479999999999885 | 0.02 | 0.01 | 0.004 |
| 2.484999999999885 | 0.019 | 0.01 | 0.004 |
| 2.489999999999885 | 0.019 | 0.01 | 0.004 |
| 2.494999999999885 | 0.019 | 0.01 | 0.004 |
| 2.499999999999884 | 0.019 | 0.01 | 0.004 |
| 2.504999999999884 | 0.019 | 0.009 | 0.004 |
| 2.509999999999884 | 0.019 | 0.009 | 0.004 |
| 2.514999999999884 | 0.019 | 0.009 | 0.004 |
| 2.519999999999884 | 0.019 | 0.009 | 0.004 |
| 2.524999999999884 | 0.018 | 0.009 | 0.004 |
| 2.529999999999884 | 0.018 | 0.009 | 0.004 |
| 2.534999999999884 | 0.018 | 0.009 | 0.004 |
| 2.539999999999884 | 0.018 | 0.009 | 0.004 |
| 2.544999999999884 | 0.018 | 0.009 | 0.004 |
| 2.549999999999883 | 0.018 | 0.009 | 0.004 |
| 2.554999999999883 | 0.018 | 0.009 | 0.004 |
| 2.559999999999883 | 0.018 | 0.009 | 0.004 |
| 2.564999999999883 | 0.017 | 0.009 | 0.004 |
| 2.569999999999883 | 0.017 | 0.009 | 0.004 |
| 2.574999999999883 | 0.017 | 0.009 | 0.004 |
| 2.579999999999883 | 0.017 | 0.009 | 0.004 |
| 2.584999999999883 | 0.017 | 0.009 | 0.004 |
| 2.589999999999883 | 0.017 | 0.009 | 0.004 |
| 2.594999999999882 | 0.017 | 0.009 | 0.004 |
| 2.599999999999882 | 0.017 | 0.009 | 0.004 |
| 2.604999999999882 | 0.016 | 0.009 | 0.004 |
| 2.609999999999882 | 0.016 | 0.009 | 0.004 |
| 2.614999999999882 | 0.016 | 0.009 | 0.004 |
| 2.619999999999882 | 0.016 | 0.008 | 0.004 |
| 2.624999999999882 | 0.016 | 0.008 | 0.004 |
| 2.629999999999882 | 0.016 | 0.008 | 0.004 |
| 2.634999999999882 | 0.016 | 0.008 | 0.004 |
| 2.639999999999881 | 0.016 | 0.008 | 0.004 |
| 2.644999999999881 | 0.016 | 0.008 | 0.004 |
| 2.649999999999881 | 0.016 | 0.008 | 0.004 |
| 2.654999999999881 | 0.015 | 0.008 | 0.004 |
| 2.659999999999881 | 0.015 | 0.008 | 0.004 |
| 2.664999999999881 | 0.015 | 0.008 | 0.004 |
| 2.669999999999881 | 0.015 | 0.008 | 0.004 |
| 2.674999999999881 | 0.015 | 0.008 | 0.004 |
| 2.679999999999881 | 0.015 | 0.008 | 0.004 |
| 2.68499999999988 | 0.015 | 0.008 | 0.004 |
| 2.68999999999988 | 0.015 | 0.008 | 0.004 |
| 2.69499999999988 | 0.015 | 0.008 | 0.004 |
| 2.69999999999988 | 0.015 | 0.008 | 0.004 |
| 2.70499999999988 | 0.014 | 0.008 | 0.004 |
| 2.70999999999988 | 0.014 | 0.008 | 0.004 |
| 2.71499999999988 | 0.014 | 0.008 | 0.004 |
| 2.71999999999988 | 0.014 | 0.008 | 0.004 |
| 2.72499999999988 | 0.014 | 0.008 | 0.004 |
| 2.72999999999988 | 0.014 | 0.008 | 0.004 |
| 2.734999999999879 | 0.014 | 0.008 | 0.004 |
| 2.739999999999879 | 0.014 | 0.008 | 0.004 |
| 2.744999999999879 | 0.014 | 0.008 | 0.004 |
| 2.749999999999879 | 0.014 | 0.007 | 0.004 |
| 2.754999999999879 | 0.014 | 0.007 | 0.004 |
| 2.759999999999879 | 0.013 | 0.007 | 0.004 |
| 2.764999999999879 | 0.013 | 0.007 | 0.004 |
| 2.769999999999879 | 0.013 | 0.007 | 0.004 |
| 2.774999999999879 | 0.013 | 0.007 | 0.004 |
| 2.779999999999878 | 0.013 | 0.007 | 0.004 |
| 2.784999999999878 | 0.013 | 0.007 | 0.004 |
| 2.789999999999878 | 0.013 | 0.007 | 0.004 |
| 2.794999999999878 | 0.013 | 0.007 | 0.004 |
| 2.799999999999878 | 0.013 | 0.007 | 0.004 |
| 2.804999999999878 | 0.013 | 0.007 | 0.004 |
| 2.809999999999878 | 0.013 | 0.007 | 0.004 |
| 2.814999999999878 | 0.013 | 0.007 | 0.003 |
| 2.819999999999878 | 0.012 | 0.007 | 0.003 |
| 2.824999999999878 | 0.012 | 0.007 | 0.003 |
| 2.829999999999877 | 0.012 | 0.007 | 0.003 |
| 2.834999999999877 | 0.012 | 0.007 | 0.003 |
| 2.839999999999877 | 0.012 | 0.007 | 0.003 |
| 2.844999999999877 | 0.012 | 0.007 | 0.003 |
| 2.849999999999877 | 0.012 | 0.007 | 0.003 |
| 2.854999999999877 | 0.012 | 0.007 | 0.003 |
| 2.859999999999877 | 0.012 | 0.007 | 0.003 |
| 2.864999999999877 | 0.012 | 0.007 | 0.003 |
| 2.869999999999877 | 0.012 | 0.007 | 0.003 |
| 2.874999999999876 | 0.012 | 0.007 | 0.003 |
| 2.879999999999876 | 0.012 | 0.007 | 0.003 |
| 2.884999999999876 | 0.012 | 0.007 | 0.003 |
| 2.889999999999876 | 0.011 | 0.007 | 0.003 |
| 2.894999999999876 | 0.011 | 0.007 | 0.003 |
| 2.899999999999876 | 0.011 | 0.006 | 0.003 |
| 2.904999999999876 | 0.011 | 0.006 | 0.003 |
| 2.909999999999876 | 0.011 | 0.006 | 0.003 |
| 2.914999999999876 | 0.011 | 0.006 | 0.003 |
| 2.919999999999876 | 0.011 | 0.006 | 0.003 |
| 2.924999999999875 | 0.011 | 0.006 | 0.003 |
| 2.929999999999875 | 0.011 | 0.006 | 0.003 |
| 2.934999999999875 | 0.011 | 0.006 | 0.003 |
| 2.939999999999875 | 0.011 | 0.006 | 0.003 |
| 2.944999999999875 | 0.011 | 0.006 | 0.003 |
| 2.949999999999875 | 0.011 | 0.006 | 0.003 |
| 2.954999999999875 | 0.011 | 0.006 | 0.003 |
| 2.959999999999875 | 0.01 | 0.006 | 0.003 |
| 2.964999999999875 | 0.01 | 0.006 | 0.003 |
| 2.969999999999874 | 0.01 | 0.006 | 0.003 |
| 2.974999999999874 | 0.01 | 0.006 | 0.003 |
| 2.979999999999874 | 0.01 | 0.006 | 0.003 |
| 2.984999999999874 | 0.01 | 0.006 | 0.003 |
| 2.989999999999874 | 0.01 | 0.006 | 0.003 |
| 2.994999999999874 | 0.01 | 0.006 | 0.003 |
| 2.999999999999874 | 0.01 | 0.006 | 0.003 |
| 3.004999999999874 | 0.01 | 0.006 | 0.003 |
| 3.009999999999874 | 0.01 | 0.006 | 0.003 |
| 3.014999999999874 | 0.01 | 0.006 | 0.003 |
| 3.019999999999873 | 0.01 | 0.006 | 0.003 |
| 3.024999999999873 | 0.01 | 0.006 | 0.003 |
| 3.029999999999873 | 0.01 | 0.006 | 0.003 |
| 3.034999999999873 | 0.01 | 0.006 | 0.003 |
| 3.039999999999873 | 0.01 | 0.006 | 0.003 |
| 3.044999999999873 | 0.009 | 0.006 | 0.003 |
| 3.049999999999873 | 0.009 | 0.006 | 0.003 |
| 3.054999999999873 | 0.009 | 0.006 | 0.003 |
| 3.059999999999873 | 0.009 | 0.006 | 0.003 |
| 3.064999999999872 | 0.009 | 0.006 | 0.003 |
| 3.069999999999872 | 0.009 | 0.006 | 0.003 |
| 3.074999999999872 | 0.009 | 0.006 | 0.003 |
| 3.079999999999872 | 0.009 | 0.005 | 0.003 |
| 3.084999999999872 | 0.009 | 0.005 | 0.003 |
| 3.089999999999872 | 0.009 | 0.005 | 0.003 |
| 3.094999999999872 | 0.009 | 0.005 | 0.003 |
| 3.099999999999872 | 0.009 | 0.005 | 0.003 |
| 3.104999999999872 | 0.009 | 0.005 | 0.003 |
| 3.109999999999872 | 0.009 | 0.005 | 0.003 |
| 3.114999999999871 | 0.009 | 0.005 | 0.003 |
| 3.119999999999871 | 0.009 | 0.005 | 0.003 |
| 3.124999999999871 | 0.009 | 0.005 | 0.003 |
| 3.129999999999871 | 0.009 | 0.005 | 0.003 |
| 3.134999999999871 | 0.009 | 0.005 | 0.003 |
| 3.139999999999871 | 0.008 | 0.005 | 0.003 |
| 3.144999999999871 | 0.008 | 0.005 | 0.003 |
| 3.149999999999871 | 0.008 | 0.005 | 0.003 |
| 3.154999999999871 | 0.008 | 0.005 | 0.003 |
| 3.15999999999987 | 0.008 | 0.005 | 0.003 |
| 3.16499999999987 | 0.008 | 0.005 | 0.003 |
| 3.16999999999987 | 0.008 | 0.005 | 0.003 |
| 3.17499999999987 | 0.008 | 0.005 | 0.003 |
| 3.17999999999987 | 0.008 | 0.005 | 0.003 |
| 3.18499999999987 | 0.008 | 0.005 | 0.003 |
| 3.18999999999987 | 0.008 | 0.005 | 0.003 |
| 3.19499999999987 | 0.008 | 0.005 | 0.003 |
| 3.19999999999987 | 0.008 | 0.005 | 0.003 |
| 3.204999999999869 | 0.008 | 0.005 | 0.003 |
| 3.209999999999869 | 0.008 | 0.005 | 0.003 |
| 3.214999999999869 | 0.008 | 0.005 | 0.003 |
| 3.219999999999869 | 0.008 | 0.005 | 0.003 |
| 3.224999999999869 | 0.008 | 0.005 | 0.003 |
| 3.229999999999869 | 0.008 | 0.005 | 0.003 |
| 3.234999999999869 | 0.008 | 0.005 | 0.003 |
| 3.239999999999869 | 0.008 | 0.005 | 0.003 |
| 3.244999999999869 | 0.008 | 0.005 | 0.003 |
| 3.249999999999869 | 0.007 | 0.005 | 0.003 |
| 3.254999999999868 | 0.007 | 0.005 | 0.003 |
| 3.259999999999868 | 0.007 | 0.005 | 0.003 |
| 3.264999999999868 | 0.007 | 0.005 | 0.003 |
| 3.269999999999868 | 0.007 | 0.005 | 0.003 |
| 3.274999999999868 | 0.007 | 0.005 | 0.003 |
| 3.279999999999868 | 0.007 | 0.005 | 0.003 |
| 3.284999999999868 | 0.007 | 0.005 | 0.003 |
| 3.289999999999868 | 0.007 | 0.005 | 0.003 |
| 3.294999999999868 | 0.007 | 0.005 | 0.003 |
| 3.299999999999867 | 0.007 | 0.005 | 0.003 |
| 3.304999999999867 | 0.007 | 0.004 | 0.003 |
| 3.309999999999867 | 0.007 | 0.004 | 0.003 |
| 3.314999999999867 | 0.007 | 0.004 | 0.003 |
| 3.319999999999867 | 0.007 | 0.004 | 0.002 |
| 3.324999999999867 | 0.007 | 0.004 | 0.002 |
| 3.329999999999867 | 0.007 | 0.004 | 0.002 |
| 3.334999999999867 | 0.007 | 0.004 | 0.002 |
| 3.339999999999867 | 0.007 | 0.004 | 0.002 |
| 3.344999999999866 | 0.007 | 0.004 | 0.002 |
| 3.349999999999866 | 0.007 | 0.004 | 0.002 |
| 3.354999999999866 | 0.007 | 0.004 | 0.002 |
| 3.359999999999866 | 0.007 | 0.004 | 0.002 |
| 3.364999999999866 | 0.007 | 0.004 | 0.002 |
| 3.369999999999866 | 0.007 | 0.004 | 0.002 |
| 3.374999999999866 | 0.007 | 0.004 | 0.002 |
| 3.379999999999866 | 0.006 | 0.004 | 0.002 |
| 3.384999999999866 | 0.006 | 0.004 | 0.002 |
| 3.389999999999866 | 0.006 | 0.004 | 0.002 |
| 3.394999999999865 | 0.006 | 0.004 | 0.002 |
| 3.399999999999865 | 0.006 | 0.004 | 0.002 |
| 3.404999999999865 | 0.006 | 0.004 | 0.002 |
| 3.409999999999865 | 0.006 | 0.004 | 0.002 |
| 3.414999999999865 | 0.006 | 0.004 | 0.002 |
| 3.419999999999865 | 0.006 | 0.004 | 0.002 |
| 3.424999999999865 | 0.006 | 0.004 | 0.002 |
| 3.429999999999865 | 0.006 | 0.004 | 0.002 |
| 3.434999999999865 | 0.006 | 0.004 | 0.002 |
| 3.439999999999864 | 0.006 | 0.004 | 0.002 |
| 3.444999999999864 | 0.006 | 0.004 | 0.002 |
| 3.449999999999864 | 0.006 | 0.004 | 0.002 |
| 3.454999999999864 | 0.006 | 0.004 | 0.002 |
| 3.459999999999864 | 0.006 | 0.004 | 0.002 |
| 3.464999999999864 | 0.006 | 0.004 | 0.002 |
| 3.469999999999864 | 0.006 | 0.004 | 0.002 |
| 3.474999999999864 | 0.006 | 0.004 | 0.002 |
| 3.479999999999864 | 0.006 | 0.004 | 0.002 |
| 3.484999999999864 | 0.006 | 0.004 | 0.002 |
| 3.489999999999863 | 0.006 | 0.004 | 0.002 |
| 3.494999999999863 | 0.006 | 0.004 | 0.002 |
| 3.499999999999863 | 0.006 | 0.004 | 0.002 |
| 3.504999999999863 | 0.006 | 0.004 | 0.002 |
| 3.509999999999863 | 0.006 | 0.004 | 0.002 |
| 3.514999999999863 | 0.006 | 0.004 | 0.002 |
| 3.519999999999863 | 0.006 | 0.004 | 0.002 |
| 3.524999999999863 | 0.006 | 0.004 | 0.002 |
| 3.529999999999863 | 0.006 | 0.004 | 0.002 |
| 3.534999999999862 | 0.005 | 0.004 | 0.002 |
| 3.539999999999862 | 0.005 | 0.004 | 0.002 |
| 3.544999999999862 | 0.005 | 0.004 | 0.002 |
| 3.549999999999862 | 0.005 | 0.004 | 0.002 |
| 3.554999999999862 | 0.005 | 0.004 | 0.002 |
| 3.559999999999862 | 0.005 | 0.004 | 0.002 |
| 3.564999999999862 | 0.005 | 0.004 | 0.002 |
| 3.569999999999862 | 0.005 | 0.004 | 0.002 |
| 3.574999999999862 | 0.005 | 0.004 | 0.002 |
| 3.579999999999862 | 0.005 | 0.004 | 0.002 |
| 3.584999999999861 | 0.005 | 0.004 | 0.002 |
| 3.589999999999861 | 0.005 | 0.004 | 0.002 |
| 3.594999999999861 | 0.005 | 0.003 | 0.002 |
| 3.599999999999861 | 0.005 | 0.003 | 0.002 |
| 3.604999999999861 | 0.005 | 0.003 | 0.002 |
| 3.609999999999861 | 0.005 | 0.003 | 0.002 |
| 3.614999999999861 | 0.005 | 0.003 | 0.002 |
| 3.619999999999861 | 0.005 | 0.003 | 0.002 |
| 3.62499999999986 | 0.005 | 0.003 | 0.002 |
| 3.62999999999986 | 0.005 | 0.003 | 0.002 |
| 3.63499999999986 | 0.005 | 0.003 | 0.002 |
| 3.63999999999986 | 0.005 | 0.003 | 0.002 |
| 3.64499999999986 | 0.005 | 0.003 | 0.002 |
| 3.64999999999986 | 0.005 | 0.003 | 0.002 |
| 3.65499999999986 | 0.005 | 0.003 | 0.002 |
| 3.65999999999986 | 0.005 | 0.003 | 0.002 |
| 3.66499999999986 | 0.005 | 0.003 | 0.002 |
| 3.669999999999859 | 0.005 | 0.003 | 0.002 |
| 3.674999999999859 | 0.005 | 0.003 | 0.002 |
| 3.679999999999859 | 0.005 | 0.003 | 0.002 |
| 3.684999999999859 | 0.005 | 0.003 | 0.002 |
| 3.689999999999859 | 0.005 | 0.003 | 0.002 |
| 3.694999999999859 | 0.005 | 0.003 | 0.002 |
| 3.699999999999859 | 0.005 | 0.003 | 0.002 |
| 3.704999999999859 | 0.005 | 0.003 | 0.002 |
| 3.709999999999859 | 0.005 | 0.003 | 0.002 |
| 3.714999999999859 | 0.005 | 0.003 | 0.002 |
| 3.719999999999858 | 0.005 | 0.003 | 0.002 |
| 3.724999999999858 | 0.005 | 0.003 | 0.002 |
| 3.729999999999858 | 0.004 | 0.003 | 0.002 |
| 3.734999999999858 | 0.004 | 0.003 | 0.002 |
| 3.739999999999858 | 0.004 | 0.003 | 0.002 |
| 3.744999999999858 | 0.004 | 0.003 | 0.002 |
| 3.749999999999858 | 0.004 | 0.003 | 0.002 |
| 3.754999999999858 | 0.004 | 0.003 | 0.002 |
| 3.759999999999858 | 0.004 | 0.003 | 0.002 |
| 3.764999999999857 | 0.004 | 0.003 | 0.002 |
| 3.769999999999857 | 0.004 | 0.003 | 0.002 |
| 3.774999999999857 | 0.004 | 0.003 | 0.002 |
| 3.779999999999857 | 0.004 | 0.003 | 0.002 |
| 3.784999999999857 | 0.004 | 0.003 | 0.002 |
| 3.789999999999857 | 0.004 | 0.003 | 0.002 |
| 3.794999999999857 | 0.004 | 0.003 | 0.002 |
| 3.799999999999857 | 0.004 | 0.003 | 0.002 |
| 3.804999999999857 | 0.004 | 0.003 | 0.002 |
| 3.809999999999857 | 0.004 | 0.003 | 0.002 |
| 3.814999999999856 | 0.004 | 0.003 | 0.002 |
| 3.819999999999856 | 0.004 | 0.003 | 0.002 |
| 3.824999999999856 | 0.004 | 0.003 | 0.002 |
| 3.829999999999856 | 0.004 | 0.003 | 0.002 |
| 3.834999999999856 | 0.004 | 0.003 | 0.002 |
| 3.839999999999856 | 0.004 | 0.003 | 0.002 |
| 3.844999999999856 | 0.004 | 0.003 | 0.002 |
| 3.849999999999856 | 0.004 | 0.003 | 0.002 |
| 3.854999999999856 | 0.004 | 0.003 | 0.002 |
| 3.859999999999855 | 0.004 | 0.003 | 0.002 |
| 3.864999999999855 | 0.004 | 0.003 | 0.002 |
| 3.869999999999855 | 0.004 | 0.003 | 0.002 |
| 3.874999999999855 | 0.004 | 0.003 | 0.002 |
| 3.879999999999855 | 0.004 | 0.003 | 0.002 |
| 3.884999999999855 | 0.004 | 0.003 | 0.002 |
| 3.889999999999855 | 0.004 | 0.003 | 0.002 |
| 3.894999999999855 | 0.004 | 0.003 | 0.002 |
| 3.899999999999855 | 0.004 | 0.003 | 0.002 |
| 3.904999999999855 | 0.004 | 0.003 | 0.002 |
| 3.909999999999854 | 0.004 | 0.003 | 0.002 |
| 3.914999999999854 | 0.004 | 0.003 | 0.002 |
| 3.919999999999854 | 0.004 | 0.003 | 0.002 |
| 3.924999999999854 | 0.004 | 0.003 | 0.002 |
| 3.929999999999854 | 0.004 | 0.003 | 0.002 |
| 3.934999999999854 | 0.004 | 0.003 | 0.002 |
| 3.939999999999854 | 0.004 | 0.003 | 0.002 |
| 3.944999999999854 | 0.004 | 0.003 | 0.002 |
| 3.949999999999854 | 0.004 | 0.003 | 0.002 |
| 3.954999999999853 | 0.004 | 0.003 | 0.002 |
| 3.959999999999853 | 0.004 | 0.003 | 0.002 |
| 3.964999999999853 | 0.004 | 0.003 | 0.002 |
| 3.969999999999853 | 0.004 | 0.003 | 0.002 |
| 3.974999999999853 | 0.004 | 0.003 | 0.002 |
| 3.979999999999853 | 0.004 | 0.003 | 0.002 |
| 3.984999999999853 | 0.004 | 0.003 | 0.002 |
| 3.989999999999853 | 0.003 | 0.003 | 0.002 |
| 3.994999999999853 | 0.003 | 0.003 | 0.002 |
| 3.999999999999853 | 0.003 | 0.003 | 0.002 |
| 4.004999999999852 | 0.003 | 0.002 | 0.002 |
| 4.009999999999852 | 0.003 | 0.002 | 0.002 |
| 4.014999999999852 | 0.003 | 0.002 | 0.002 |
| 4.019999999999852 | 0.003 | 0.002 | 0.002 |
| 4.024999999999852 | 0.003 | 0.002 | 0.002 |
| 4.029999999999852 | 0.003 | 0.002 | 0.002 |
| 4.034999999999852 | 0.003 | 0.002 | 0.002 |
| 4.039999999999851 | 0.003 | 0.002 | 0.002 |
| 4.044999999999852 | 0.003 | 0.002 | 0.002 |
| 4.049999999999851 | 0.003 | 0.002 | 0.002 |
| 4.054999999999851 | 0.003 | 0.002 | 0.002 |
| 4.059999999999851 | 0.003 | 0.002 | 0.002 |
| 4.064999999999851 | 0.003 | 0.002 | 0.002 |
| 4.069999999999851 | 0.003 | 0.002 | 0.002 |
| 4.074999999999851 | 0.003 | 0.002 | 0.002 |
| 4.07999999999985 | 0.003 | 0.002 | 0.002 |
| 4.084999999999851 | 0.003 | 0.002 | 0.002 |
| 4.08999999999985 | 0.003 | 0.002 | 0.002 |
| 4.094999999999851 | 0.003 | 0.002 | 0.002 |
| 4.09999999999985 | 0.003 | 0.002 | 0.002 |
| 4.10499999999985 | 0.003 | 0.002 | 0.001 |
| 4.10999999999985 | 0.003 | 0.002 | 0.001 |
| 4.11499999999985 | 0.003 | 0.002 | 0.001 |
| 4.11999999999985 | 0.003 | 0.002 | 0.001 |
| 4.12499999999985 | 0.003 | 0.002 | 0.001 |
| 4.12999999999985 | 0.003 | 0.002 | 0.001 |
| 4.13499999999985 | 0.003 | 0.002 | 0.001 |
| 4.13999999999985 | 0.003 | 0.002 | 0.001 |
| 4.144999999999849 | 0.003 | 0.002 | 0.001 |
| 4.14999999999985 | 0.003 | 0.002 | 0.001 |
| 4.154999999999849 | 0.003 | 0.002 | 0.001 |
| 4.15999999999985 | 0.003 | 0.002 | 0.001 |
| 4.164999999999849 | 0.003 | 0.002 | 0.001 |
| 4.169999999999849 | 0.003 | 0.002 | 0.001 |
| 4.174999999999849 | 0.003 | 0.002 | 0.001 |
| 4.179999999999848 | 0.003 | 0.002 | 0.001 |
| 4.184999999999849 | 0.003 | 0.002 | 0.001 |
| 4.189999999999848 | 0.003 | 0.002 | 0.001 |
| 4.194999999999848 | 0.003 | 0.002 | 0.001 |
| 4.199999999999848 | 0.003 | 0.002 | 0.001 |
| 4.204999999999848 | 0.003 | 0.002 | 0.001 |
| 4.209999999999848 | 0.003 | 0.002 | 0.001 |
| 4.214999999999848 | 0.003 | 0.002 | 0.001 |
| 4.219999999999847 | 0.003 | 0.002 | 0.001 |
| 4.224999999999848 | 0.003 | 0.002 | 0.001 |
| 4.229999999999847 | 0.003 | 0.002 | 0.001 |
| 4.234999999999847 | 0.003 | 0.002 | 0.001 |
| 4.239999999999847 | 0.003 | 0.002 | 0.001 |
| 4.244999999999847 | 0.003 | 0.002 | 0.001 |
| 4.249999999999847 | 0.003 | 0.002 | 0.001 |
| 4.254999999999847 | 0.003 | 0.002 | 0.001 |
| 4.259999999999846 | 0.003 | 0.002 | 0.001 |
| 4.264999999999847 | 0.003 | 0.002 | 0.001 |
| 4.269999999999846 | 0.003 | 0.002 | 0.001 |
| 4.274999999999846 | 0.003 | 0.002 | 0.001 |
| 4.279999999999846 | 0.003 | 0.002 | 0.001 |
| 4.284999999999846 | 0.003 | 0.002 | 0.001 |
| 4.289999999999846 | 0.003 | 0.002 | 0.001 |
| 4.294999999999846 | 0.003 | 0.002 | 0.001 |
| 4.299999999999846 | 0.003 | 0.002 | 0.001 |
| 4.304999999999846 | 0.003 | 0.002 | 0.001 |
| 4.309999999999845 | 0.003 | 0.002 | 0.001 |
| 4.314999999999846 | 0.003 | 0.002 | 0.001 |
| 4.319999999999845 | 0.003 | 0.002 | 0.001 |
| 4.324999999999846 | 0.003 | 0.002 | 0.001 |
| 4.329999999999845 | 0.003 | 0.002 | 0.001 |
| 4.334999999999845 | 0.003 | 0.002 | 0.001 |
| 4.339999999999845 | 0.003 | 0.002 | 0.001 |
| 4.344999999999845 | 0.003 | 0.002 | 0.001 |
| 4.349999999999845 | 0.003 | 0.002 | 0.001 |
| 4.354999999999845 | 0.003 | 0.002 | 0.001 |
| 4.359999999999844 | 0.002 | 0.002 | 0.001 |
| 4.364999999999845 | 0.002 | 0.002 | 0.001 |
| 4.369999999999844 | 0.002 | 0.002 | 0.001 |
| 4.374999999999844 | 0.002 | 0.002 | 0.001 |
| 4.379999999999844 | 0.002 | 0.002 | 0.001 |
| 4.384999999999844 | 0.002 | 0.002 | 0.001 |
| 4.389999999999844 | 0.002 | 0.002 | 0.001 |
| 4.394999999999844 | 0.002 | 0.002 | 0.001 |
| 4.399999999999844 | 0.002 | 0.002 | 0.001 |
| 4.404999999999844 | 0.002 | 0.002 | 0.001 |
| 4.409999999999843 | 0.002 | 0.002 | 0.001 |
| 4.414999999999844 | 0.002 | 0.002 | 0.001 |
| 4.419999999999843 | 0.002 | 0.002 | 0.001 |
| 4.424999999999843 | 0.002 | 0.002 | 0.001 |
| 4.429999999999843 | 0.002 | 0.002 | 0.001 |
| 4.434999999999843 | 0.002 | 0.002 | 0.001 |
| 4.439999999999843 | 0.002 | 0.002 | 0.001 |
| 4.444999999999843 | 0.002 | 0.002 | 0.001 |
| 4.449999999999842 | 0.002 | 0.002 | 0.001 |
| 4.454999999999843 | 0.002 | 0.002 | 0.001 |
| 4.459999999999842 | 0.002 | 0.002 | 0.001 |
| 4.464999999999843 | 0.002 | 0.002 | 0.001 |
| 4.469999999999842 | 0.002 | 0.002 | 0.001 |
| 4.474999999999842 | 0.002 | 0.002 | 0.001 |
| 4.479999999999842 | 0.002 | 0.002 | 0.001 |
| 4.484999999999842 | 0.002 | 0.002 | 0.001 |
| 4.489999999999842 | 0.002 | 0.002 | 0.001 |
| 4.494999999999842 | 0.002 | 0.002 | 0.001 |
| 4.499999999999841 | 0.002 | 0.002 | 0.001 |
| 4.504999999999842 | 0.002 | 0.002 | 0.001 |
| 4.509999999999841 | 0.002 | 0.002 | 0.001 |
| 4.514999999999842 | 0.002 | 0.002 | 0.001 |
| 4.519999999999841 | 0.002 | 0.002 | 0.001 |
| 4.524999999999841 | 0.002 | 0.002 | 0.001 |
| 4.529999999999841 | 0.002 | 0.002 | 0.001 |
| 4.534999999999841 | 0.002 | 0.002 | 0.001 |
| 4.53999999999984 | 0.002 | 0.002 | 0.001 |
| 4.544999999999841 | 0.002 | 0.002 | 0.001 |
| 4.54999999999984 | 0.002 | 0.002 | 0.001 |
| 4.554999999999841 | 0.002 | 0.002 | 0.001 |
| 4.55999999999984 | 0.002 | 0.002 | 0.001 |
| 4.564999999999841 | 0.002 | 0.002 | 0.001 |
| 4.56999999999984 | 0.002 | 0.002 | 0.001 |
| 4.57499999999984 | 0.002 | 0.002 | 0.001 |
| 4.57999999999984 | 0.002 | 0.002 | 0.001 |
| 4.58499999999984 | 0.002 | 0.002 | 0.001 |
| 4.58999999999984 | 0.002 | 0.002 | 0.001 |
| 4.59499999999984 | 0.002 | 0.002 | 0.001 |
| 4.59999999999984 | 0.002 | 0.002 | 0.001 |
| 4.60499999999984 | 0.002 | 0.002 | 0.001 |
| 4.60999999999984 | 0.002 | 0.002 | 0.001 |
| 4.614999999999839 | 0.002 | 0.002 | 0.001 |
| 4.61999999999984 | 0.002 | 0.002 | 0.001 |
| 4.624999999999839 | 0.002 | 0.002 | 0.001 |
| 4.62999999999984 | 0.002 | 0.002 | 0.001 |
| 4.634999999999839 | 0.002 | 0.002 | 0.001 |
| 4.639999999999838 | 0.002 | 0.002 | 0.001 |
| 4.644999999999839 | 0.002 | 0.002 | 0.001 |
| 4.649999999999838 | 0.002 | 0.002 | 0.001 |
| 4.654999999999839 | 0.002 | 0.002 | 0.001 |
| 4.659999999999838 | 0.002 | 0.002 | 0.001 |
| 4.664999999999838 | 0.002 | 0.002 | 0.001 |
| 4.669999999999838 | 0.002 | 0.002 | 0.001 |
| 4.674999999999838 | 0.002 | 0.001 | 0.001 |
| 4.679999999999837 | 0.002 | 0.001 | 0.001 |
| 4.684999999999838 | 0.002 | 0.001 | 0.001 |
| 4.689999999999837 | 0.002 | 0.001 | 0.001 |
| 4.694999999999838 | 0.002 | 0.001 | 0.001 |
| 4.699999999999837 | 0.002 | 0.001 | 0.001 |
| 4.704999999999837 | 0.002 | 0.001 | 0.001 |
| 4.709999999999837 | 0.002 | 0.001 | 0.001 |
| 4.714999999999837 | 0.002 | 0.001 | 0.001 |
| 4.719999999999837 | 0.002 | 0.001 | 0.001 |
| 4.724999999999837 | 0.002 | 0.001 | 0.001 |
| 4.729999999999836 | 0.002 | 0.001 | 0.001 |
| 4.734999999999836 | 0.002 | 0.001 | 0.001 |
| 4.739999999999836 | 0.002 | 0.001 | 0.001 |
| 4.744999999999836 | 0.002 | 0.001 | 0.001 |
| 4.749999999999836 | 0.002 | 0.001 | 0.001 |
| 4.754999999999836 | 0.002 | 0.001 | 0.001 |
| 4.759999999999836 | 0.002 | 0.001 | 0.001 |
| 4.764999999999836 | 0.002 | 0.001 | 0.001 |
| 4.769999999999836 | 0.002 | 0.001 | 0.001 |
| 4.774999999999835 | 0.002 | 0.001 | 0.001 |
| 4.779999999999835 | 0.002 | 0.001 | 0.001 |
| 4.784999999999835 | 0.002 | 0.001 | 0.001 |
| 4.789999999999835 | 0.002 | 0.001 | 0.001 |
| 4.794999999999835 | 0.002 | 0.001 | 0.001 |
| 4.799999999999835 | 0.002 | 0.001 | 0.001 |
| 4.804999999999835 | 0.002 | 0.001 | 0.001 |
| 4.809999999999835 | 0.002 | 0.001 | 0.001 |
| 4.814999999999835 | 0.002 | 0.001 | 0.001 |
| 4.819999999999835 | 0.002 | 0.001 | 0.001 |
| 4.824999999999835 | 0.002 | 0.001 | 0.001 |
| 4.829999999999834 | 0.002 | 0.001 | 0.001 |
| 4.834999999999834 | 0.002 | 0.001 | 0.001 |
| 4.839999999999834 | 0.002 | 0.001 | 0.001 |
| 4.844999999999834 | 0.002 | 0.001 | 0.001 |
| 4.849999999999834 | 0.002 | 0.001 | 0.001 |
| 4.854999999999834 | 0.002 | 0.001 | 0.001 |
| 4.859999999999834 | 0.002 | 0.001 | 0.001 |
| 4.864999999999834 | 0.002 | 0.001 | 0.001 |
| 4.869999999999834 | 0.002 | 0.001 | 0.001 |
| 4.874999999999834 | 0.002 | 0.001 | 0.001 |
| 4.879999999999833 | 0.002 | 0.001 | 0.001 |
| 4.884999999999834 | 0.002 | 0.001 | 0.001 |
| 4.889999999999833 | 0.002 | 0.001 | 0.001 |
| 4.894999999999833 | 0.002 | 0.001 | 0.001 |
| 4.899999999999833 | 0.002 | 0.001 | 0.001 |
| 4.904999999999833 | 0.002 | 0.001 | 0.001 |
| 4.909999999999833 | 0.002 | 0.001 | 0.001 |
| 4.914999999999833 | 0.002 | 0.001 | 0.001 |
| 4.919999999999832 | 0.002 | 0.001 | 0.001 |
| 4.924999999999833 | 0.002 | 0.001 | 0.001 |
| 4.929999999999832 | 0.002 | 0.001 | 0.001 |
| 4.934999999999832 | 0.002 | 0.001 | 0.001 |
| 4.939999999999832 | 0.002 | 0.001 | 0.001 |
| 4.944999999999832 | 0.002 | 0.001 | 0.001 |
| 4.949999999999832 | 0.002 | 0.001 | 0.001 |
| 4.954999999999832 | 0.002 | 0.001 | 0.001 |
| 4.959999999999832 | 0.002 | 0.001 | 0.001 |
| 4.964999999999832 | 0.002 | 0.001 | 0.001 |
| 4.969999999999831 | 0.002 | 0.001 | 0.001 |
| 4.974999999999831 | 0.002 | 0.001 | 0.001 |
| 4.97999999999983 | 0.002 | 0.001 | 0.001 |
| 4.984999999999831 | 0.001 | 0.001 | 0.001 |
| 4.98999999999983 | 0.001 | 0.001 | 0.001 |
| 4.994999999999831 | 0.001 | 0.001 | 0.001 |
| 4.99999999999983 | 0.001 | 0.001 | 0.001 |